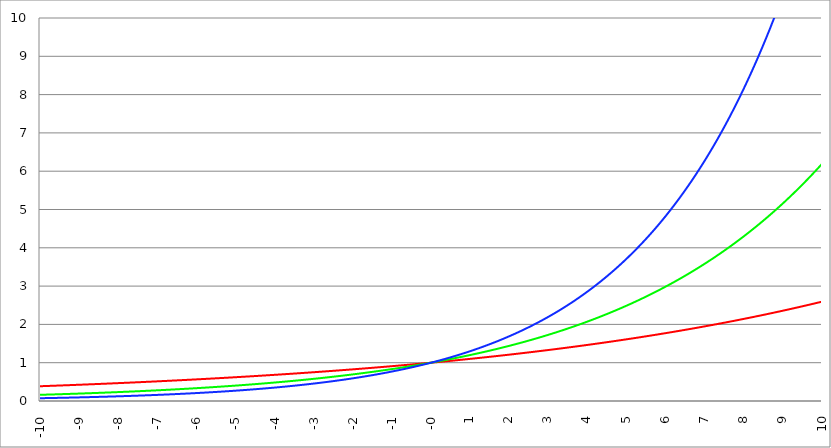
| Category | Series 1 | Series 0 | Series 2 |
|---|---|---|---|
| -10.0 | 0.386 | 0.162 | 0.073 |
| -9.99 | 0.386 | 0.162 | 0.073 |
| -9.98 | 0.386 | 0.162 | 0.073 |
| -9.97 | 0.387 | 0.162 | 0.073 |
| -9.96 | 0.387 | 0.163 | 0.073 |
| -9.95 | 0.387 | 0.163 | 0.073 |
| -9.940000000000001 | 0.388 | 0.163 | 0.074 |
| -9.930000000000001 | 0.388 | 0.164 | 0.074 |
| -9.920000000000002 | 0.388 | 0.164 | 0.074 |
| -9.91 | 0.389 | 0.164 | 0.074 |
| -9.900000000000002 | 0.389 | 0.164 | 0.074 |
| -9.890000000000002 | 0.39 | 0.165 | 0.075 |
| -9.880000000000003 | 0.39 | 0.165 | 0.075 |
| -9.870000000000003 | 0.39 | 0.165 | 0.075 |
| -9.860000000000001 | 0.391 | 0.166 | 0.075 |
| -9.850000000000003 | 0.391 | 0.166 | 0.075 |
| -9.840000000000003 | 0.391 | 0.166 | 0.076 |
| -9.830000000000004 | 0.392 | 0.167 | 0.076 |
| -9.820000000000004 | 0.392 | 0.167 | 0.076 |
| -9.810000000000004 | 0.393 | 0.167 | 0.076 |
| -9.800000000000004 | 0.393 | 0.168 | 0.076 |
| -9.790000000000004 | 0.393 | 0.168 | 0.077 |
| -9.780000000000005 | 0.394 | 0.168 | 0.077 |
| -9.770000000000005 | 0.394 | 0.168 | 0.077 |
| -9.760000000000005 | 0.394 | 0.169 | 0.077 |
| -9.750000000000005 | 0.395 | 0.169 | 0.077 |
| -9.740000000000006 | 0.395 | 0.169 | 0.078 |
| -9.730000000000006 | 0.396 | 0.17 | 0.078 |
| -9.720000000000006 | 0.396 | 0.17 | 0.078 |
| -9.710000000000006 | 0.396 | 0.17 | 0.078 |
| -9.700000000000006 | 0.397 | 0.171 | 0.078 |
| -9.690000000000007 | 0.397 | 0.171 | 0.079 |
| -9.680000000000007 | 0.397 | 0.171 | 0.079 |
| -9.670000000000007 | 0.398 | 0.172 | 0.079 |
| -9.660000000000007 | 0.398 | 0.172 | 0.079 |
| -9.650000000000007 | 0.399 | 0.172 | 0.08 |
| -9.640000000000008 | 0.399 | 0.172 | 0.08 |
| -9.630000000000008 | 0.399 | 0.173 | 0.08 |
| -9.620000000000008 | 0.4 | 0.173 | 0.08 |
| -9.610000000000008 | 0.4 | 0.173 | 0.08 |
| -9.600000000000009 | 0.401 | 0.174 | 0.081 |
| -9.590000000000009 | 0.401 | 0.174 | 0.081 |
| -9.580000000000007 | 0.401 | 0.174 | 0.081 |
| -9.57000000000001 | 0.402 | 0.175 | 0.081 |
| -9.56000000000001 | 0.402 | 0.175 | 0.081 |
| -9.55000000000001 | 0.402 | 0.175 | 0.082 |
| -9.54000000000001 | 0.403 | 0.176 | 0.082 |
| -9.53000000000001 | 0.403 | 0.176 | 0.082 |
| -9.52000000000001 | 0.404 | 0.176 | 0.082 |
| -9.51000000000001 | 0.404 | 0.177 | 0.082 |
| -9.50000000000001 | 0.404 | 0.177 | 0.083 |
| -9.49000000000001 | 0.405 | 0.177 | 0.083 |
| -9.48000000000001 | 0.405 | 0.178 | 0.083 |
| -9.47000000000001 | 0.406 | 0.178 | 0.083 |
| -9.46000000000001 | 0.406 | 0.178 | 0.084 |
| -9.45000000000001 | 0.406 | 0.179 | 0.084 |
| -9.44000000000001 | 0.407 | 0.179 | 0.084 |
| -9.430000000000012 | 0.407 | 0.179 | 0.084 |
| -9.420000000000012 | 0.407 | 0.18 | 0.084 |
| -9.410000000000013 | 0.408 | 0.18 | 0.085 |
| -9.400000000000013 | 0.408 | 0.18 | 0.085 |
| -9.390000000000011 | 0.409 | 0.181 | 0.085 |
| -9.380000000000013 | 0.409 | 0.181 | 0.085 |
| -9.370000000000013 | 0.409 | 0.181 | 0.086 |
| -9.360000000000014 | 0.41 | 0.181 | 0.086 |
| -9.350000000000014 | 0.41 | 0.182 | 0.086 |
| -9.340000000000014 | 0.411 | 0.182 | 0.086 |
| -9.330000000000014 | 0.411 | 0.182 | 0.086 |
| -9.320000000000014 | 0.411 | 0.183 | 0.087 |
| -9.310000000000015 | 0.412 | 0.183 | 0.087 |
| -9.300000000000013 | 0.412 | 0.183 | 0.087 |
| -9.290000000000015 | 0.413 | 0.184 | 0.087 |
| -9.280000000000015 | 0.413 | 0.184 | 0.088 |
| -9.270000000000016 | 0.413 | 0.184 | 0.088 |
| -9.260000000000016 | 0.414 | 0.185 | 0.088 |
| -9.250000000000014 | 0.414 | 0.185 | 0.088 |
| -9.240000000000016 | 0.415 | 0.186 | 0.089 |
| -9.230000000000016 | 0.415 | 0.186 | 0.089 |
| -9.220000000000017 | 0.415 | 0.186 | 0.089 |
| -9.210000000000017 | 0.416 | 0.187 | 0.089 |
| -9.200000000000017 | 0.416 | 0.187 | 0.089 |
| -9.190000000000017 | 0.416 | 0.187 | 0.09 |
| -9.180000000000017 | 0.417 | 0.188 | 0.09 |
| -9.170000000000018 | 0.417 | 0.188 | 0.09 |
| -9.160000000000016 | 0.418 | 0.188 | 0.09 |
| -9.150000000000018 | 0.418 | 0.189 | 0.091 |
| -9.140000000000018 | 0.418 | 0.189 | 0.091 |
| -9.130000000000019 | 0.419 | 0.189 | 0.091 |
| -9.120000000000019 | 0.419 | 0.19 | 0.091 |
| -9.110000000000017 | 0.42 | 0.19 | 0.092 |
| -9.10000000000002 | 0.42 | 0.19 | 0.092 |
| -9.09000000000002 | 0.42 | 0.191 | 0.092 |
| -9.08000000000002 | 0.421 | 0.191 | 0.092 |
| -9.07000000000002 | 0.421 | 0.191 | 0.093 |
| -9.06000000000002 | 0.422 | 0.192 | 0.093 |
| -9.05000000000002 | 0.422 | 0.192 | 0.093 |
| -9.04000000000002 | 0.422 | 0.192 | 0.093 |
| -9.03000000000002 | 0.423 | 0.193 | 0.094 |
| -9.020000000000021 | 0.423 | 0.193 | 0.094 |
| -9.010000000000021 | 0.424 | 0.193 | 0.094 |
| -9.000000000000021 | 0.424 | 0.194 | 0.094 |
| -8.990000000000022 | 0.425 | 0.194 | 0.095 |
| -8.980000000000022 | 0.425 | 0.195 | 0.095 |
| -8.97000000000002 | 0.425 | 0.195 | 0.095 |
| -8.960000000000022 | 0.426 | 0.195 | 0.095 |
| -8.950000000000022 | 0.426 | 0.196 | 0.096 |
| -8.940000000000023 | 0.427 | 0.196 | 0.096 |
| -8.930000000000023 | 0.427 | 0.196 | 0.096 |
| -8.920000000000023 | 0.427 | 0.197 | 0.096 |
| -8.910000000000023 | 0.428 | 0.197 | 0.097 |
| -8.900000000000023 | 0.428 | 0.197 | 0.097 |
| -8.890000000000024 | 0.429 | 0.198 | 0.097 |
| -8.880000000000024 | 0.429 | 0.198 | 0.097 |
| -8.870000000000024 | 0.429 | 0.198 | 0.098 |
| -8.860000000000024 | 0.43 | 0.199 | 0.098 |
| -8.850000000000025 | 0.43 | 0.199 | 0.098 |
| -8.840000000000025 | 0.431 | 0.2 | 0.098 |
| -8.830000000000025 | 0.431 | 0.2 | 0.099 |
| -8.820000000000025 | 0.431 | 0.2 | 0.099 |
| -8.810000000000025 | 0.432 | 0.201 | 0.099 |
| -8.800000000000026 | 0.432 | 0.201 | 0.099 |
| -8.790000000000026 | 0.433 | 0.201 | 0.1 |
| -8.780000000000026 | 0.433 | 0.202 | 0.1 |
| -8.770000000000026 | 0.433 | 0.202 | 0.1 |
| -8.760000000000026 | 0.434 | 0.202 | 0.1 |
| -8.750000000000027 | 0.434 | 0.203 | 0.101 |
| -8.740000000000027 | 0.435 | 0.203 | 0.101 |
| -8.730000000000027 | 0.435 | 0.204 | 0.101 |
| -8.720000000000027 | 0.436 | 0.204 | 0.101 |
| -8.710000000000027 | 0.436 | 0.204 | 0.102 |
| -8.700000000000028 | 0.436 | 0.205 | 0.102 |
| -8.690000000000028 | 0.437 | 0.205 | 0.102 |
| -8.680000000000028 | 0.437 | 0.205 | 0.103 |
| -8.670000000000028 | 0.438 | 0.206 | 0.103 |
| -8.660000000000029 | 0.438 | 0.206 | 0.103 |
| -8.650000000000029 | 0.438 | 0.207 | 0.103 |
| -8.640000000000029 | 0.439 | 0.207 | 0.104 |
| -8.63000000000003 | 0.439 | 0.207 | 0.104 |
| -8.62000000000003 | 0.44 | 0.208 | 0.104 |
| -8.61000000000003 | 0.44 | 0.208 | 0.104 |
| -8.60000000000003 | 0.441 | 0.208 | 0.105 |
| -8.59000000000003 | 0.441 | 0.209 | 0.105 |
| -8.58000000000003 | 0.441 | 0.209 | 0.105 |
| -8.57000000000003 | 0.442 | 0.21 | 0.106 |
| -8.56000000000003 | 0.442 | 0.21 | 0.106 |
| -8.55000000000003 | 0.443 | 0.21 | 0.106 |
| -8.540000000000031 | 0.443 | 0.211 | 0.106 |
| -8.530000000000031 | 0.444 | 0.211 | 0.107 |
| -8.520000000000032 | 0.444 | 0.212 | 0.107 |
| -8.510000000000032 | 0.444 | 0.212 | 0.107 |
| -8.50000000000003 | 0.445 | 0.212 | 0.108 |
| -8.490000000000032 | 0.445 | 0.213 | 0.108 |
| -8.480000000000032 | 0.446 | 0.213 | 0.108 |
| -8.470000000000033 | 0.446 | 0.213 | 0.108 |
| -8.460000000000033 | 0.446 | 0.214 | 0.109 |
| -8.450000000000033 | 0.447 | 0.214 | 0.109 |
| -8.440000000000033 | 0.447 | 0.215 | 0.109 |
| -8.430000000000033 | 0.448 | 0.215 | 0.11 |
| -8.420000000000034 | 0.448 | 0.215 | 0.11 |
| -8.410000000000032 | 0.449 | 0.216 | 0.11 |
| -8.400000000000034 | 0.449 | 0.216 | 0.11 |
| -8.390000000000034 | 0.449 | 0.217 | 0.111 |
| -8.380000000000035 | 0.45 | 0.217 | 0.111 |
| -8.370000000000035 | 0.45 | 0.217 | 0.111 |
| -8.360000000000033 | 0.451 | 0.218 | 0.112 |
| -8.350000000000035 | 0.451 | 0.218 | 0.112 |
| -8.340000000000035 | 0.452 | 0.219 | 0.112 |
| -8.330000000000036 | 0.452 | 0.219 | 0.112 |
| -8.320000000000036 | 0.452 | 0.219 | 0.113 |
| -8.310000000000034 | 0.453 | 0.22 | 0.113 |
| -8.300000000000036 | 0.453 | 0.22 | 0.113 |
| -8.290000000000036 | 0.454 | 0.221 | 0.114 |
| -8.280000000000037 | 0.454 | 0.221 | 0.114 |
| -8.270000000000037 | 0.455 | 0.221 | 0.114 |
| -8.260000000000037 | 0.455 | 0.222 | 0.115 |
| -8.250000000000037 | 0.456 | 0.222 | 0.115 |
| -8.240000000000038 | 0.456 | 0.223 | 0.115 |
| -8.230000000000038 | 0.456 | 0.223 | 0.115 |
| -8.220000000000038 | 0.457 | 0.223 | 0.116 |
| -8.210000000000038 | 0.457 | 0.224 | 0.116 |
| -8.200000000000038 | 0.458 | 0.224 | 0.116 |
| -8.190000000000039 | 0.458 | 0.225 | 0.117 |
| -8.180000000000039 | 0.459 | 0.225 | 0.117 |
| -8.170000000000037 | 0.459 | 0.225 | 0.117 |
| -8.16000000000004 | 0.459 | 0.226 | 0.118 |
| -8.15000000000004 | 0.46 | 0.226 | 0.118 |
| -8.14000000000004 | 0.46 | 0.227 | 0.118 |
| -8.13000000000004 | 0.461 | 0.227 | 0.118 |
| -8.12000000000004 | 0.461 | 0.228 | 0.119 |
| -8.11000000000004 | 0.462 | 0.228 | 0.119 |
| -8.10000000000004 | 0.462 | 0.228 | 0.119 |
| -8.09000000000004 | 0.463 | 0.229 | 0.12 |
| -8.08000000000004 | 0.463 | 0.229 | 0.12 |
| -8.07000000000004 | 0.463 | 0.23 | 0.12 |
| -8.06000000000004 | 0.464 | 0.23 | 0.121 |
| -8.05000000000004 | 0.464 | 0.23 | 0.121 |
| -8.040000000000042 | 0.465 | 0.231 | 0.121 |
| -8.03000000000004 | 0.465 | 0.231 | 0.122 |
| -8.020000000000042 | 0.466 | 0.232 | 0.122 |
| -8.010000000000042 | 0.466 | 0.232 | 0.122 |
| -8.000000000000043 | 0.467 | 0.233 | 0.123 |
| -7.990000000000043 | 0.467 | 0.233 | 0.123 |
| -7.980000000000043 | 0.467 | 0.233 | 0.123 |
| -7.970000000000043 | 0.468 | 0.234 | 0.124 |
| -7.960000000000043 | 0.468 | 0.234 | 0.124 |
| -7.950000000000044 | 0.469 | 0.235 | 0.124 |
| -7.940000000000044 | 0.469 | 0.235 | 0.125 |
| -7.930000000000044 | 0.47 | 0.236 | 0.125 |
| -7.920000000000044 | 0.47 | 0.236 | 0.125 |
| -7.910000000000044 | 0.471 | 0.236 | 0.126 |
| -7.900000000000044 | 0.471 | 0.237 | 0.126 |
| -7.890000000000045 | 0.471 | 0.237 | 0.126 |
| -7.880000000000045 | 0.472 | 0.238 | 0.127 |
| -7.870000000000045 | 0.472 | 0.238 | 0.127 |
| -7.860000000000046 | 0.473 | 0.239 | 0.127 |
| -7.850000000000046 | 0.473 | 0.239 | 0.128 |
| -7.840000000000046 | 0.474 | 0.239 | 0.128 |
| -7.830000000000046 | 0.474 | 0.24 | 0.128 |
| -7.820000000000046 | 0.475 | 0.24 | 0.129 |
| -7.810000000000047 | 0.475 | 0.241 | 0.129 |
| -7.800000000000047 | 0.475 | 0.241 | 0.129 |
| -7.790000000000047 | 0.476 | 0.242 | 0.13 |
| -7.780000000000047 | 0.476 | 0.242 | 0.13 |
| -7.770000000000047 | 0.477 | 0.243 | 0.13 |
| -7.760000000000048 | 0.477 | 0.243 | 0.131 |
| -7.750000000000048 | 0.478 | 0.243 | 0.131 |
| -7.740000000000048 | 0.478 | 0.244 | 0.131 |
| -7.730000000000048 | 0.479 | 0.244 | 0.132 |
| -7.720000000000049 | 0.479 | 0.245 | 0.132 |
| -7.710000000000049 | 0.48 | 0.245 | 0.132 |
| -7.700000000000049 | 0.48 | 0.246 | 0.133 |
| -7.690000000000049 | 0.48 | 0.246 | 0.133 |
| -7.680000000000049 | 0.481 | 0.247 | 0.133 |
| -7.67000000000005 | 0.481 | 0.247 | 0.134 |
| -7.66000000000005 | 0.482 | 0.247 | 0.134 |
| -7.65000000000005 | 0.482 | 0.248 | 0.134 |
| -7.64000000000005 | 0.483 | 0.248 | 0.135 |
| -7.63000000000005 | 0.483 | 0.249 | 0.135 |
| -7.620000000000051 | 0.484 | 0.249 | 0.135 |
| -7.610000000000051 | 0.484 | 0.25 | 0.136 |
| -7.600000000000051 | 0.485 | 0.25 | 0.136 |
| -7.590000000000051 | 0.485 | 0.251 | 0.137 |
| -7.580000000000052 | 0.486 | 0.251 | 0.137 |
| -7.570000000000052 | 0.486 | 0.252 | 0.137 |
| -7.560000000000052 | 0.486 | 0.252 | 0.138 |
| -7.550000000000052 | 0.487 | 0.252 | 0.138 |
| -7.540000000000052 | 0.487 | 0.253 | 0.138 |
| -7.530000000000053 | 0.488 | 0.253 | 0.139 |
| -7.520000000000053 | 0.488 | 0.254 | 0.139 |
| -7.510000000000053 | 0.489 | 0.254 | 0.139 |
| -7.500000000000053 | 0.489 | 0.255 | 0.14 |
| -7.490000000000053 | 0.49 | 0.255 | 0.14 |
| -7.480000000000054 | 0.49 | 0.256 | 0.141 |
| -7.470000000000054 | 0.491 | 0.256 | 0.141 |
| -7.460000000000054 | 0.491 | 0.257 | 0.141 |
| -7.450000000000054 | 0.492 | 0.257 | 0.142 |
| -7.440000000000054 | 0.492 | 0.258 | 0.142 |
| -7.430000000000054 | 0.493 | 0.258 | 0.142 |
| -7.420000000000055 | 0.493 | 0.259 | 0.143 |
| -7.410000000000055 | 0.493 | 0.259 | 0.143 |
| -7.400000000000055 | 0.494 | 0.259 | 0.143 |
| -7.390000000000056 | 0.494 | 0.26 | 0.144 |
| -7.380000000000056 | 0.495 | 0.26 | 0.144 |
| -7.370000000000056 | 0.495 | 0.261 | 0.145 |
| -7.360000000000056 | 0.496 | 0.261 | 0.145 |
| -7.350000000000056 | 0.496 | 0.262 | 0.145 |
| -7.340000000000057 | 0.497 | 0.262 | 0.146 |
| -7.330000000000057 | 0.497 | 0.263 | 0.146 |
| -7.320000000000057 | 0.498 | 0.263 | 0.147 |
| -7.310000000000057 | 0.498 | 0.264 | 0.147 |
| -7.300000000000058 | 0.499 | 0.264 | 0.147 |
| -7.290000000000058 | 0.499 | 0.265 | 0.148 |
| -7.280000000000058 | 0.5 | 0.265 | 0.148 |
| -7.270000000000058 | 0.5 | 0.266 | 0.148 |
| -7.260000000000058 | 0.501 | 0.266 | 0.149 |
| -7.250000000000059 | 0.501 | 0.267 | 0.149 |
| -7.240000000000059 | 0.502 | 0.267 | 0.15 |
| -7.23000000000006 | 0.502 | 0.268 | 0.15 |
| -7.220000000000059 | 0.503 | 0.268 | 0.15 |
| -7.210000000000059 | 0.503 | 0.269 | 0.151 |
| -7.20000000000006 | 0.503 | 0.269 | 0.151 |
| -7.19000000000006 | 0.504 | 0.27 | 0.152 |
| -7.18000000000006 | 0.504 | 0.27 | 0.152 |
| -7.17000000000006 | 0.505 | 0.271 | 0.152 |
| -7.160000000000061 | 0.505 | 0.271 | 0.153 |
| -7.150000000000061 | 0.506 | 0.272 | 0.153 |
| -7.140000000000061 | 0.506 | 0.272 | 0.154 |
| -7.130000000000061 | 0.507 | 0.273 | 0.154 |
| -7.120000000000061 | 0.507 | 0.273 | 0.154 |
| -7.110000000000062 | 0.508 | 0.274 | 0.155 |
| -7.100000000000062 | 0.508 | 0.274 | 0.155 |
| -7.090000000000062 | 0.509 | 0.275 | 0.156 |
| -7.080000000000062 | 0.509 | 0.275 | 0.156 |
| -7.070000000000062 | 0.51 | 0.276 | 0.156 |
| -7.060000000000063 | 0.51 | 0.276 | 0.157 |
| -7.050000000000063 | 0.511 | 0.277 | 0.157 |
| -7.040000000000063 | 0.511 | 0.277 | 0.158 |
| -7.030000000000063 | 0.512 | 0.278 | 0.158 |
| -7.020000000000064 | 0.512 | 0.278 | 0.159 |
| -7.010000000000064 | 0.513 | 0.279 | 0.159 |
| -7.000000000000064 | 0.513 | 0.279 | 0.159 |
| -6.990000000000064 | 0.514 | 0.28 | 0.16 |
| -6.980000000000064 | 0.514 | 0.28 | 0.16 |
| -6.970000000000064 | 0.515 | 0.281 | 0.161 |
| -6.960000000000064 | 0.515 | 0.281 | 0.161 |
| -6.950000000000064 | 0.516 | 0.282 | 0.161 |
| -6.940000000000065 | 0.516 | 0.282 | 0.162 |
| -6.930000000000065 | 0.517 | 0.283 | 0.162 |
| -6.920000000000065 | 0.517 | 0.283 | 0.163 |
| -6.910000000000065 | 0.518 | 0.284 | 0.163 |
| -6.900000000000066 | 0.518 | 0.284 | 0.164 |
| -6.890000000000066 | 0.519 | 0.285 | 0.164 |
| -6.880000000000066 | 0.519 | 0.285 | 0.164 |
| -6.870000000000066 | 0.52 | 0.286 | 0.165 |
| -6.860000000000067 | 0.52 | 0.286 | 0.165 |
| -6.850000000000067 | 0.521 | 0.287 | 0.166 |
| -6.840000000000067 | 0.521 | 0.287 | 0.166 |
| -6.830000000000067 | 0.522 | 0.288 | 0.167 |
| -6.820000000000068 | 0.522 | 0.288 | 0.167 |
| -6.810000000000068 | 0.523 | 0.289 | 0.168 |
| -6.800000000000068 | 0.523 | 0.289 | 0.168 |
| -6.790000000000068 | 0.524 | 0.29 | 0.168 |
| -6.780000000000068 | 0.524 | 0.291 | 0.169 |
| -6.770000000000068 | 0.525 | 0.291 | 0.169 |
| -6.760000000000069 | 0.525 | 0.292 | 0.17 |
| -6.75000000000007 | 0.526 | 0.292 | 0.17 |
| -6.74000000000007 | 0.526 | 0.293 | 0.171 |
| -6.73000000000007 | 0.527 | 0.293 | 0.171 |
| -6.72000000000007 | 0.527 | 0.294 | 0.172 |
| -6.71000000000007 | 0.528 | 0.294 | 0.172 |
| -6.70000000000007 | 0.528 | 0.295 | 0.172 |
| -6.69000000000007 | 0.529 | 0.295 | 0.173 |
| -6.680000000000071 | 0.529 | 0.296 | 0.173 |
| -6.670000000000071 | 0.53 | 0.296 | 0.174 |
| -6.660000000000071 | 0.53 | 0.297 | 0.174 |
| -6.650000000000071 | 0.531 | 0.297 | 0.175 |
| -6.640000000000072 | 0.531 | 0.298 | 0.175 |
| -6.630000000000072 | 0.532 | 0.299 | 0.176 |
| -6.620000000000072 | 0.532 | 0.299 | 0.176 |
| -6.610000000000072 | 0.533 | 0.3 | 0.177 |
| -6.600000000000072 | 0.533 | 0.3 | 0.177 |
| -6.590000000000073 | 0.534 | 0.301 | 0.177 |
| -6.580000000000073 | 0.534 | 0.301 | 0.178 |
| -6.570000000000073 | 0.535 | 0.302 | 0.178 |
| -6.560000000000073 | 0.535 | 0.302 | 0.179 |
| -6.550000000000074 | 0.536 | 0.303 | 0.179 |
| -6.540000000000074 | 0.536 | 0.303 | 0.18 |
| -6.530000000000074 | 0.537 | 0.304 | 0.18 |
| -6.520000000000074 | 0.537 | 0.305 | 0.181 |
| -6.510000000000074 | 0.538 | 0.305 | 0.181 |
| -6.500000000000074 | 0.538 | 0.306 | 0.182 |
| -6.490000000000074 | 0.539 | 0.306 | 0.182 |
| -6.480000000000074 | 0.539 | 0.307 | 0.183 |
| -6.470000000000075 | 0.54 | 0.307 | 0.183 |
| -6.460000000000075 | 0.54 | 0.308 | 0.184 |
| -6.450000000000075 | 0.541 | 0.309 | 0.184 |
| -6.440000000000075 | 0.541 | 0.309 | 0.185 |
| -6.430000000000076 | 0.542 | 0.31 | 0.185 |
| -6.420000000000076 | 0.542 | 0.31 | 0.186 |
| -6.410000000000076 | 0.543 | 0.311 | 0.186 |
| -6.400000000000076 | 0.543 | 0.311 | 0.187 |
| -6.390000000000077 | 0.544 | 0.312 | 0.187 |
| -6.380000000000077 | 0.544 | 0.312 | 0.188 |
| -6.370000000000077 | 0.545 | 0.313 | 0.188 |
| -6.360000000000078 | 0.545 | 0.314 | 0.189 |
| -6.350000000000078 | 0.546 | 0.314 | 0.189 |
| -6.340000000000078 | 0.546 | 0.315 | 0.189 |
| -6.330000000000078 | 0.547 | 0.315 | 0.19 |
| -6.320000000000078 | 0.548 | 0.316 | 0.19 |
| -6.310000000000079 | 0.548 | 0.316 | 0.191 |
| -6.300000000000079 | 0.549 | 0.317 | 0.191 |
| -6.29000000000008 | 0.549 | 0.318 | 0.192 |
| -6.28000000000008 | 0.55 | 0.318 | 0.193 |
| -6.27000000000008 | 0.55 | 0.319 | 0.193 |
| -6.26000000000008 | 0.551 | 0.319 | 0.194 |
| -6.25000000000008 | 0.551 | 0.32 | 0.194 |
| -6.24000000000008 | 0.552 | 0.321 | 0.195 |
| -6.23000000000008 | 0.552 | 0.321 | 0.195 |
| -6.220000000000081 | 0.553 | 0.322 | 0.196 |
| -6.210000000000081 | 0.553 | 0.322 | 0.196 |
| -6.200000000000081 | 0.554 | 0.323 | 0.197 |
| -6.190000000000081 | 0.554 | 0.323 | 0.197 |
| -6.180000000000081 | 0.555 | 0.324 | 0.198 |
| -6.170000000000082 | 0.555 | 0.325 | 0.198 |
| -6.160000000000082 | 0.556 | 0.325 | 0.199 |
| -6.150000000000082 | 0.556 | 0.326 | 0.199 |
| -6.140000000000082 | 0.557 | 0.326 | 0.2 |
| -6.130000000000082 | 0.558 | 0.327 | 0.2 |
| -6.120000000000083 | 0.558 | 0.328 | 0.201 |
| -6.110000000000083 | 0.559 | 0.328 | 0.201 |
| -6.100000000000083 | 0.559 | 0.329 | 0.202 |
| -6.090000000000083 | 0.56 | 0.329 | 0.202 |
| -6.080000000000084 | 0.56 | 0.33 | 0.203 |
| -6.070000000000084 | 0.561 | 0.331 | 0.203 |
| -6.060000000000084 | 0.561 | 0.331 | 0.204 |
| -6.050000000000084 | 0.562 | 0.332 | 0.204 |
| -6.040000000000084 | 0.562 | 0.332 | 0.205 |
| -6.030000000000084 | 0.563 | 0.333 | 0.206 |
| -6.020000000000085 | 0.563 | 0.334 | 0.206 |
| -6.010000000000085 | 0.564 | 0.334 | 0.207 |
| -6.000000000000085 | 0.564 | 0.335 | 0.207 |
| -5.990000000000085 | 0.565 | 0.336 | 0.208 |
| -5.980000000000085 | 0.566 | 0.336 | 0.208 |
| -5.970000000000085 | 0.566 | 0.337 | 0.209 |
| -5.960000000000086 | 0.567 | 0.337 | 0.209 |
| -5.950000000000086 | 0.567 | 0.338 | 0.21 |
| -5.940000000000086 | 0.568 | 0.339 | 0.21 |
| -5.930000000000086 | 0.568 | 0.339 | 0.211 |
| -5.920000000000087 | 0.569 | 0.34 | 0.212 |
| -5.910000000000087 | 0.569 | 0.34 | 0.212 |
| -5.900000000000087 | 0.57 | 0.341 | 0.213 |
| -5.890000000000088 | 0.57 | 0.342 | 0.213 |
| -5.880000000000088 | 0.571 | 0.342 | 0.214 |
| -5.870000000000088 | 0.572 | 0.343 | 0.214 |
| -5.860000000000088 | 0.572 | 0.344 | 0.215 |
| -5.850000000000088 | 0.573 | 0.344 | 0.215 |
| -5.840000000000089 | 0.573 | 0.345 | 0.216 |
| -5.830000000000089 | 0.574 | 0.345 | 0.217 |
| -5.820000000000089 | 0.574 | 0.346 | 0.217 |
| -5.810000000000089 | 0.575 | 0.347 | 0.218 |
| -5.800000000000089 | 0.575 | 0.347 | 0.218 |
| -5.79000000000009 | 0.576 | 0.348 | 0.219 |
| -5.78000000000009 | 0.576 | 0.349 | 0.219 |
| -5.77000000000009 | 0.577 | 0.349 | 0.22 |
| -5.76000000000009 | 0.578 | 0.35 | 0.221 |
| -5.750000000000091 | 0.578 | 0.351 | 0.221 |
| -5.740000000000091 | 0.579 | 0.351 | 0.222 |
| -5.730000000000091 | 0.579 | 0.352 | 0.222 |
| -5.720000000000091 | 0.58 | 0.352 | 0.223 |
| -5.710000000000091 | 0.58 | 0.353 | 0.224 |
| -5.700000000000092 | 0.581 | 0.354 | 0.224 |
| -5.690000000000092 | 0.581 | 0.354 | 0.225 |
| -5.680000000000092 | 0.582 | 0.355 | 0.225 |
| -5.670000000000092 | 0.583 | 0.356 | 0.226 |
| -5.660000000000092 | 0.583 | 0.356 | 0.227 |
| -5.650000000000093 | 0.584 | 0.357 | 0.227 |
| -5.640000000000093 | 0.584 | 0.358 | 0.228 |
| -5.630000000000093 | 0.585 | 0.358 | 0.228 |
| -5.620000000000093 | 0.585 | 0.359 | 0.229 |
| -5.610000000000093 | 0.586 | 0.36 | 0.229 |
| -5.600000000000094 | 0.586 | 0.36 | 0.23 |
| -5.590000000000094 | 0.587 | 0.361 | 0.231 |
| -5.580000000000094 | 0.588 | 0.362 | 0.231 |
| -5.570000000000094 | 0.588 | 0.362 | 0.232 |
| -5.560000000000095 | 0.589 | 0.363 | 0.233 |
| -5.550000000000095 | 0.589 | 0.364 | 0.233 |
| -5.540000000000095 | 0.59 | 0.364 | 0.234 |
| -5.530000000000095 | 0.59 | 0.365 | 0.234 |
| -5.520000000000095 | 0.591 | 0.366 | 0.235 |
| -5.510000000000096 | 0.591 | 0.366 | 0.236 |
| -5.500000000000096 | 0.592 | 0.367 | 0.236 |
| -5.490000000000096 | 0.593 | 0.368 | 0.237 |
| -5.480000000000096 | 0.593 | 0.368 | 0.237 |
| -5.470000000000096 | 0.594 | 0.369 | 0.238 |
| -5.460000000000097 | 0.594 | 0.37 | 0.239 |
| -5.450000000000097 | 0.595 | 0.37 | 0.239 |
| -5.440000000000097 | 0.595 | 0.371 | 0.24 |
| -5.430000000000097 | 0.596 | 0.372 | 0.241 |
| -5.420000000000098 | 0.597 | 0.372 | 0.241 |
| -5.410000000000098 | 0.597 | 0.373 | 0.242 |
| -5.400000000000098 | 0.598 | 0.374 | 0.242 |
| -5.390000000000098 | 0.598 | 0.374 | 0.243 |
| -5.380000000000098 | 0.599 | 0.375 | 0.244 |
| -5.370000000000099 | 0.599 | 0.376 | 0.244 |
| -5.360000000000099 | 0.6 | 0.376 | 0.245 |
| -5.350000000000099 | 0.601 | 0.377 | 0.246 |
| -5.340000000000099 | 0.601 | 0.378 | 0.246 |
| -5.330000000000099 | 0.602 | 0.378 | 0.247 |
| -5.3200000000001 | 0.602 | 0.379 | 0.248 |
| -5.3100000000001 | 0.603 | 0.38 | 0.248 |
| -5.3000000000001 | 0.603 | 0.38 | 0.249 |
| -5.2900000000001 | 0.604 | 0.381 | 0.25 |
| -5.2800000000001 | 0.605 | 0.382 | 0.25 |
| -5.2700000000001 | 0.605 | 0.383 | 0.251 |
| -5.260000000000101 | 0.606 | 0.383 | 0.252 |
| -5.250000000000101 | 0.606 | 0.384 | 0.252 |
| -5.240000000000101 | 0.607 | 0.385 | 0.253 |
| -5.230000000000101 | 0.607 | 0.385 | 0.254 |
| -5.220000000000102 | 0.608 | 0.386 | 0.254 |
| -5.210000000000102 | 0.609 | 0.387 | 0.255 |
| -5.200000000000102 | 0.609 | 0.387 | 0.256 |
| -5.190000000000103 | 0.61 | 0.388 | 0.256 |
| -5.180000000000103 | 0.61 | 0.389 | 0.257 |
| -5.170000000000103 | 0.611 | 0.39 | 0.258 |
| -5.160000000000103 | 0.612 | 0.39 | 0.258 |
| -5.150000000000103 | 0.612 | 0.391 | 0.259 |
| -5.140000000000104 | 0.613 | 0.392 | 0.26 |
| -5.130000000000104 | 0.613 | 0.392 | 0.26 |
| -5.120000000000104 | 0.614 | 0.393 | 0.261 |
| -5.110000000000104 | 0.614 | 0.394 | 0.262 |
| -5.100000000000104 | 0.615 | 0.395 | 0.262 |
| -5.090000000000104 | 0.616 | 0.395 | 0.263 |
| -5.080000000000104 | 0.616 | 0.396 | 0.264 |
| -5.070000000000105 | 0.617 | 0.397 | 0.264 |
| -5.060000000000105 | 0.617 | 0.398 | 0.265 |
| -5.050000000000105 | 0.618 | 0.398 | 0.266 |
| -5.040000000000105 | 0.619 | 0.399 | 0.267 |
| -5.030000000000105 | 0.619 | 0.4 | 0.267 |
| -5.020000000000106 | 0.62 | 0.4 | 0.268 |
| -5.010000000000106 | 0.62 | 0.401 | 0.269 |
| -5.000000000000106 | 0.621 | 0.402 | 0.269 |
| -4.990000000000106 | 0.622 | 0.403 | 0.27 |
| -4.980000000000106 | 0.622 | 0.403 | 0.271 |
| -4.970000000000107 | 0.623 | 0.404 | 0.271 |
| -4.960000000000107 | 0.623 | 0.405 | 0.272 |
| -4.950000000000107 | 0.624 | 0.406 | 0.273 |
| -4.940000000000107 | 0.624 | 0.406 | 0.274 |
| -4.930000000000108 | 0.625 | 0.407 | 0.274 |
| -4.920000000000108 | 0.626 | 0.408 | 0.275 |
| -4.910000000000108 | 0.626 | 0.409 | 0.276 |
| -4.900000000000108 | 0.627 | 0.409 | 0.276 |
| -4.890000000000109 | 0.627 | 0.41 | 0.277 |
| -4.88000000000011 | 0.628 | 0.411 | 0.278 |
| -4.87000000000011 | 0.629 | 0.412 | 0.279 |
| -4.86000000000011 | 0.629 | 0.412 | 0.279 |
| -4.85000000000011 | 0.63 | 0.413 | 0.28 |
| -4.84000000000011 | 0.63 | 0.414 | 0.281 |
| -4.83000000000011 | 0.631 | 0.415 | 0.282 |
| -4.82000000000011 | 0.632 | 0.415 | 0.282 |
| -4.810000000000111 | 0.632 | 0.416 | 0.283 |
| -4.800000000000111 | 0.633 | 0.417 | 0.284 |
| -4.790000000000111 | 0.633 | 0.418 | 0.285 |
| -4.780000000000111 | 0.634 | 0.418 | 0.285 |
| -4.770000000000111 | 0.635 | 0.419 | 0.286 |
| -4.760000000000112 | 0.635 | 0.42 | 0.287 |
| -4.750000000000112 | 0.636 | 0.421 | 0.288 |
| -4.740000000000112 | 0.637 | 0.421 | 0.288 |
| -4.730000000000112 | 0.637 | 0.422 | 0.289 |
| -4.720000000000112 | 0.638 | 0.423 | 0.29 |
| -4.710000000000113 | 0.638 | 0.424 | 0.291 |
| -4.700000000000113 | 0.639 | 0.424 | 0.291 |
| -4.690000000000113 | 0.64 | 0.425 | 0.292 |
| -4.680000000000113 | 0.64 | 0.426 | 0.293 |
| -4.670000000000114 | 0.641 | 0.427 | 0.294 |
| -4.660000000000114 | 0.641 | 0.428 | 0.294 |
| -4.650000000000114 | 0.642 | 0.428 | 0.295 |
| -4.640000000000114 | 0.643 | 0.429 | 0.296 |
| -4.630000000000114 | 0.643 | 0.43 | 0.297 |
| -4.620000000000115 | 0.644 | 0.431 | 0.298 |
| -4.610000000000115 | 0.644 | 0.431 | 0.298 |
| -4.600000000000115 | 0.645 | 0.432 | 0.299 |
| -4.590000000000115 | 0.646 | 0.433 | 0.3 |
| -4.580000000000115 | 0.646 | 0.434 | 0.301 |
| -4.570000000000115 | 0.647 | 0.435 | 0.301 |
| -4.560000000000116 | 0.648 | 0.435 | 0.302 |
| -4.550000000000116 | 0.648 | 0.436 | 0.303 |
| -4.540000000000116 | 0.649 | 0.437 | 0.304 |
| -4.530000000000116 | 0.649 | 0.438 | 0.305 |
| -4.520000000000117 | 0.65 | 0.439 | 0.305 |
| -4.510000000000117 | 0.651 | 0.439 | 0.306 |
| -4.500000000000117 | 0.651 | 0.44 | 0.307 |
| -4.490000000000117 | 0.652 | 0.441 | 0.308 |
| -4.480000000000117 | 0.652 | 0.442 | 0.309 |
| -4.470000000000117 | 0.653 | 0.443 | 0.31 |
| -4.460000000000118 | 0.654 | 0.443 | 0.31 |
| -4.450000000000118 | 0.654 | 0.444 | 0.311 |
| -4.440000000000118 | 0.655 | 0.445 | 0.312 |
| -4.430000000000118 | 0.656 | 0.446 | 0.313 |
| -4.420000000000119 | 0.656 | 0.447 | 0.314 |
| -4.41000000000012 | 0.657 | 0.448 | 0.314 |
| -4.40000000000012 | 0.657 | 0.448 | 0.315 |
| -4.39000000000012 | 0.658 | 0.449 | 0.316 |
| -4.38000000000012 | 0.659 | 0.45 | 0.317 |
| -4.37000000000012 | 0.659 | 0.451 | 0.318 |
| -4.36000000000012 | 0.66 | 0.452 | 0.319 |
| -4.35000000000012 | 0.661 | 0.452 | 0.319 |
| -4.34000000000012 | 0.661 | 0.453 | 0.32 |
| -4.33000000000012 | 0.662 | 0.454 | 0.321 |
| -4.320000000000121 | 0.662 | 0.455 | 0.322 |
| -4.310000000000121 | 0.663 | 0.456 | 0.323 |
| -4.300000000000121 | 0.664 | 0.457 | 0.324 |
| -4.290000000000121 | 0.664 | 0.457 | 0.324 |
| -4.280000000000121 | 0.665 | 0.458 | 0.325 |
| -4.270000000000122 | 0.666 | 0.459 | 0.326 |
| -4.260000000000122 | 0.666 | 0.46 | 0.327 |
| -4.250000000000122 | 0.667 | 0.461 | 0.328 |
| -4.240000000000122 | 0.668 | 0.462 | 0.329 |
| -4.230000000000122 | 0.668 | 0.462 | 0.33 |
| -4.220000000000123 | 0.669 | 0.463 | 0.33 |
| -4.210000000000123 | 0.669 | 0.464 | 0.331 |
| -4.200000000000123 | 0.67 | 0.465 | 0.332 |
| -4.190000000000124 | 0.671 | 0.466 | 0.333 |
| -4.180000000000124 | 0.671 | 0.467 | 0.334 |
| -4.170000000000124 | 0.672 | 0.468 | 0.335 |
| -4.160000000000124 | 0.673 | 0.468 | 0.336 |
| -4.150000000000124 | 0.673 | 0.469 | 0.337 |
| -4.140000000000124 | 0.674 | 0.47 | 0.338 |
| -4.130000000000125 | 0.675 | 0.471 | 0.338 |
| -4.120000000000125 | 0.675 | 0.472 | 0.339 |
| -4.110000000000125 | 0.676 | 0.473 | 0.34 |
| -4.100000000000125 | 0.677 | 0.474 | 0.341 |
| -4.090000000000125 | 0.677 | 0.474 | 0.342 |
| -4.080000000000126 | 0.678 | 0.475 | 0.343 |
| -4.070000000000126 | 0.678 | 0.476 | 0.344 |
| -4.060000000000126 | 0.679 | 0.477 | 0.345 |
| -4.050000000000126 | 0.68 | 0.478 | 0.346 |
| -4.040000000000127 | 0.68 | 0.479 | 0.346 |
| -4.030000000000127 | 0.681 | 0.48 | 0.347 |
| -4.020000000000127 | 0.682 | 0.48 | 0.348 |
| -4.010000000000127 | 0.682 | 0.481 | 0.349 |
| -4.000000000000127 | 0.683 | 0.482 | 0.35 |
| -3.990000000000128 | 0.684 | 0.483 | 0.351 |
| -3.980000000000128 | 0.684 | 0.484 | 0.352 |
| -3.970000000000129 | 0.685 | 0.485 | 0.353 |
| -3.960000000000129 | 0.686 | 0.486 | 0.354 |
| -3.950000000000129 | 0.686 | 0.487 | 0.355 |
| -3.940000000000129 | 0.687 | 0.488 | 0.356 |
| -3.930000000000129 | 0.688 | 0.488 | 0.357 |
| -3.92000000000013 | 0.688 | 0.489 | 0.358 |
| -3.91000000000013 | 0.689 | 0.49 | 0.358 |
| -3.90000000000013 | 0.69 | 0.491 | 0.359 |
| -3.89000000000013 | 0.69 | 0.492 | 0.36 |
| -3.88000000000013 | 0.691 | 0.493 | 0.361 |
| -3.870000000000131 | 0.692 | 0.494 | 0.362 |
| -3.860000000000131 | 0.692 | 0.495 | 0.363 |
| -3.850000000000131 | 0.693 | 0.496 | 0.364 |
| -3.840000000000131 | 0.694 | 0.497 | 0.365 |
| -3.830000000000131 | 0.694 | 0.497 | 0.366 |
| -3.820000000000132 | 0.695 | 0.498 | 0.367 |
| -3.810000000000132 | 0.695 | 0.499 | 0.368 |
| -3.800000000000132 | 0.696 | 0.5 | 0.369 |
| -3.790000000000132 | 0.697 | 0.501 | 0.37 |
| -3.780000000000132 | 0.697 | 0.502 | 0.371 |
| -3.770000000000133 | 0.698 | 0.503 | 0.372 |
| -3.760000000000133 | 0.699 | 0.504 | 0.373 |
| -3.750000000000133 | 0.699 | 0.505 | 0.374 |
| -3.740000000000133 | 0.7 | 0.506 | 0.375 |
| -3.730000000000134 | 0.701 | 0.507 | 0.376 |
| -3.720000000000134 | 0.701 | 0.508 | 0.377 |
| -3.710000000000134 | 0.702 | 0.508 | 0.378 |
| -3.700000000000134 | 0.703 | 0.509 | 0.379 |
| -3.690000000000134 | 0.703 | 0.51 | 0.38 |
| -3.680000000000135 | 0.704 | 0.511 | 0.381 |
| -3.670000000000135 | 0.705 | 0.512 | 0.382 |
| -3.660000000000135 | 0.706 | 0.513 | 0.383 |
| -3.650000000000135 | 0.706 | 0.514 | 0.384 |
| -3.640000000000135 | 0.707 | 0.515 | 0.385 |
| -3.630000000000136 | 0.708 | 0.516 | 0.386 |
| -3.620000000000136 | 0.708 | 0.517 | 0.387 |
| -3.610000000000136 | 0.709 | 0.518 | 0.388 |
| -3.600000000000136 | 0.71 | 0.519 | 0.389 |
| -3.590000000000137 | 0.71 | 0.52 | 0.39 |
| -3.580000000000137 | 0.711 | 0.521 | 0.391 |
| -3.570000000000137 | 0.712 | 0.522 | 0.392 |
| -3.560000000000137 | 0.712 | 0.523 | 0.393 |
| -3.550000000000137 | 0.713 | 0.523 | 0.394 |
| -3.540000000000138 | 0.714 | 0.524 | 0.395 |
| -3.530000000000138 | 0.714 | 0.525 | 0.396 |
| -3.520000000000138 | 0.715 | 0.526 | 0.397 |
| -3.510000000000138 | 0.716 | 0.527 | 0.398 |
| -3.500000000000139 | 0.716 | 0.528 | 0.399 |
| -3.490000000000139 | 0.717 | 0.529 | 0.4 |
| -3.480000000000139 | 0.718 | 0.53 | 0.401 |
| -3.470000000000139 | 0.718 | 0.531 | 0.402 |
| -3.460000000000139 | 0.719 | 0.532 | 0.403 |
| -3.45000000000014 | 0.72 | 0.533 | 0.404 |
| -3.44000000000014 | 0.72 | 0.534 | 0.406 |
| -3.43000000000014 | 0.721 | 0.535 | 0.407 |
| -3.42000000000014 | 0.722 | 0.536 | 0.408 |
| -3.41000000000014 | 0.723 | 0.537 | 0.409 |
| -3.400000000000141 | 0.723 | 0.538 | 0.41 |
| -3.390000000000141 | 0.724 | 0.539 | 0.411 |
| -3.380000000000141 | 0.725 | 0.54 | 0.412 |
| -3.370000000000141 | 0.725 | 0.541 | 0.413 |
| -3.360000000000141 | 0.726 | 0.542 | 0.414 |
| -3.350000000000142 | 0.727 | 0.543 | 0.415 |
| -3.340000000000142 | 0.727 | 0.544 | 0.416 |
| -3.330000000000142 | 0.728 | 0.545 | 0.417 |
| -3.320000000000142 | 0.729 | 0.546 | 0.419 |
| -3.310000000000143 | 0.729 | 0.547 | 0.42 |
| -3.300000000000143 | 0.73 | 0.548 | 0.421 |
| -3.290000000000143 | 0.731 | 0.549 | 0.422 |
| -3.280000000000143 | 0.732 | 0.55 | 0.423 |
| -3.270000000000143 | 0.732 | 0.551 | 0.424 |
| -3.260000000000144 | 0.733 | 0.552 | 0.425 |
| -3.250000000000144 | 0.734 | 0.553 | 0.426 |
| -3.240000000000144 | 0.734 | 0.554 | 0.427 |
| -3.230000000000144 | 0.735 | 0.555 | 0.429 |
| -3.220000000000145 | 0.736 | 0.556 | 0.43 |
| -3.210000000000145 | 0.736 | 0.557 | 0.431 |
| -3.200000000000145 | 0.737 | 0.558 | 0.432 |
| -3.190000000000145 | 0.738 | 0.559 | 0.433 |
| -3.180000000000145 | 0.739 | 0.56 | 0.434 |
| -3.170000000000146 | 0.739 | 0.561 | 0.435 |
| -3.160000000000146 | 0.74 | 0.562 | 0.436 |
| -3.150000000000146 | 0.741 | 0.563 | 0.438 |
| -3.140000000000146 | 0.741 | 0.564 | 0.439 |
| -3.130000000000146 | 0.742 | 0.565 | 0.44 |
| -3.120000000000147 | 0.743 | 0.566 | 0.441 |
| -3.110000000000147 | 0.743 | 0.567 | 0.442 |
| -3.100000000000147 | 0.744 | 0.568 | 0.443 |
| -3.090000000000147 | 0.745 | 0.569 | 0.445 |
| -3.080000000000147 | 0.746 | 0.57 | 0.446 |
| -3.070000000000148 | 0.746 | 0.571 | 0.447 |
| -3.060000000000148 | 0.747 | 0.572 | 0.448 |
| -3.050000000000148 | 0.748 | 0.573 | 0.449 |
| -3.040000000000148 | 0.748 | 0.574 | 0.45 |
| -3.030000000000149 | 0.749 | 0.576 | 0.452 |
| -3.020000000000149 | 0.75 | 0.577 | 0.453 |
| -3.010000000000149 | 0.751 | 0.578 | 0.454 |
| -3.000000000000149 | 0.751 | 0.579 | 0.455 |
| -2.990000000000149 | 0.752 | 0.58 | 0.456 |
| -2.98000000000015 | 0.753 | 0.581 | 0.458 |
| -2.97000000000015 | 0.753 | 0.582 | 0.459 |
| -2.96000000000015 | 0.754 | 0.583 | 0.46 |
| -2.95000000000015 | 0.755 | 0.584 | 0.461 |
| -2.94000000000015 | 0.756 | 0.585 | 0.462 |
| -2.930000000000151 | 0.756 | 0.586 | 0.464 |
| -2.920000000000151 | 0.757 | 0.587 | 0.465 |
| -2.910000000000151 | 0.758 | 0.588 | 0.466 |
| -2.900000000000151 | 0.759 | 0.589 | 0.467 |
| -2.890000000000151 | 0.759 | 0.59 | 0.468 |
| -2.880000000000152 | 0.76 | 0.592 | 0.47 |
| -2.870000000000152 | 0.761 | 0.593 | 0.471 |
| -2.860000000000152 | 0.761 | 0.594 | 0.472 |
| -2.850000000000152 | 0.762 | 0.595 | 0.473 |
| -2.840000000000153 | 0.763 | 0.596 | 0.475 |
| -2.830000000000153 | 0.764 | 0.597 | 0.476 |
| -2.820000000000153 | 0.764 | 0.598 | 0.477 |
| -2.810000000000153 | 0.765 | 0.599 | 0.478 |
| -2.800000000000153 | 0.766 | 0.6 | 0.48 |
| -2.790000000000154 | 0.767 | 0.601 | 0.481 |
| -2.780000000000154 | 0.767 | 0.602 | 0.482 |
| -2.770000000000154 | 0.768 | 0.603 | 0.483 |
| -2.760000000000154 | 0.769 | 0.605 | 0.485 |
| -2.750000000000154 | 0.769 | 0.606 | 0.486 |
| -2.740000000000155 | 0.77 | 0.607 | 0.487 |
| -2.730000000000155 | 0.771 | 0.608 | 0.489 |
| -2.720000000000155 | 0.772 | 0.609 | 0.49 |
| -2.710000000000155 | 0.772 | 0.61 | 0.491 |
| -2.700000000000156 | 0.773 | 0.611 | 0.492 |
| -2.690000000000156 | 0.774 | 0.612 | 0.494 |
| -2.680000000000156 | 0.775 | 0.613 | 0.495 |
| -2.670000000000156 | 0.775 | 0.615 | 0.496 |
| -2.660000000000156 | 0.776 | 0.616 | 0.498 |
| -2.650000000000157 | 0.777 | 0.617 | 0.499 |
| -2.640000000000157 | 0.778 | 0.618 | 0.5 |
| -2.630000000000157 | 0.778 | 0.619 | 0.502 |
| -2.620000000000157 | 0.779 | 0.62 | 0.503 |
| -2.610000000000157 | 0.78 | 0.621 | 0.504 |
| -2.600000000000158 | 0.781 | 0.622 | 0.506 |
| -2.590000000000158 | 0.781 | 0.624 | 0.507 |
| -2.580000000000158 | 0.782 | 0.625 | 0.508 |
| -2.570000000000158 | 0.783 | 0.626 | 0.51 |
| -2.560000000000159 | 0.783 | 0.627 | 0.511 |
| -2.550000000000159 | 0.784 | 0.628 | 0.512 |
| -2.54000000000016 | 0.785 | 0.629 | 0.514 |
| -2.530000000000159 | 0.786 | 0.63 | 0.515 |
| -2.520000000000159 | 0.786 | 0.632 | 0.516 |
| -2.51000000000016 | 0.787 | 0.633 | 0.518 |
| -2.50000000000016 | 0.788 | 0.634 | 0.519 |
| -2.49000000000016 | 0.789 | 0.635 | 0.52 |
| -2.48000000000016 | 0.789 | 0.636 | 0.522 |
| -2.47000000000016 | 0.79 | 0.637 | 0.523 |
| -2.460000000000161 | 0.791 | 0.639 | 0.524 |
| -2.450000000000161 | 0.792 | 0.64 | 0.526 |
| -2.440000000000161 | 0.793 | 0.641 | 0.527 |
| -2.430000000000161 | 0.793 | 0.642 | 0.529 |
| -2.420000000000162 | 0.794 | 0.643 | 0.53 |
| -2.410000000000162 | 0.795 | 0.644 | 0.531 |
| -2.400000000000162 | 0.796 | 0.646 | 0.533 |
| -2.390000000000162 | 0.796 | 0.647 | 0.534 |
| -2.380000000000162 | 0.797 | 0.648 | 0.536 |
| -2.370000000000163 | 0.798 | 0.649 | 0.537 |
| -2.360000000000163 | 0.799 | 0.65 | 0.538 |
| -2.350000000000163 | 0.799 | 0.652 | 0.54 |
| -2.340000000000163 | 0.8 | 0.653 | 0.541 |
| -2.330000000000163 | 0.801 | 0.654 | 0.543 |
| -2.320000000000164 | 0.802 | 0.655 | 0.544 |
| -2.310000000000164 | 0.802 | 0.656 | 0.545 |
| -2.300000000000164 | 0.803 | 0.657 | 0.547 |
| -2.290000000000164 | 0.804 | 0.659 | 0.548 |
| -2.280000000000165 | 0.805 | 0.66 | 0.55 |
| -2.270000000000165 | 0.805 | 0.661 | 0.551 |
| -2.260000000000165 | 0.806 | 0.662 | 0.553 |
| -2.250000000000165 | 0.807 | 0.664 | 0.554 |
| -2.240000000000165 | 0.808 | 0.665 | 0.556 |
| -2.230000000000166 | 0.809 | 0.666 | 0.557 |
| -2.220000000000166 | 0.809 | 0.667 | 0.559 |
| -2.210000000000166 | 0.81 | 0.668 | 0.56 |
| -2.200000000000166 | 0.811 | 0.67 | 0.561 |
| -2.190000000000166 | 0.812 | 0.671 | 0.563 |
| -2.180000000000167 | 0.812 | 0.672 | 0.564 |
| -2.170000000000167 | 0.813 | 0.673 | 0.566 |
| -2.160000000000167 | 0.814 | 0.674 | 0.567 |
| -2.150000000000167 | 0.815 | 0.676 | 0.569 |
| -2.140000000000168 | 0.815 | 0.677 | 0.57 |
| -2.130000000000168 | 0.816 | 0.678 | 0.572 |
| -2.120000000000168 | 0.817 | 0.679 | 0.573 |
| -2.110000000000168 | 0.818 | 0.681 | 0.575 |
| -2.100000000000168 | 0.819 | 0.682 | 0.576 |
| -2.090000000000169 | 0.819 | 0.683 | 0.578 |
| -2.080000000000169 | 0.82 | 0.684 | 0.579 |
| -2.070000000000169 | 0.821 | 0.686 | 0.581 |
| -2.060000000000169 | 0.822 | 0.687 | 0.582 |
| -2.050000000000169 | 0.823 | 0.688 | 0.584 |
| -2.04000000000017 | 0.823 | 0.689 | 0.586 |
| -2.03000000000017 | 0.824 | 0.691 | 0.587 |
| -2.02000000000017 | 0.825 | 0.692 | 0.589 |
| -2.01000000000017 | 0.826 | 0.693 | 0.59 |
| -2.000000000000171 | 0.826 | 0.694 | 0.592 |
| -1.99000000000017 | 0.827 | 0.696 | 0.593 |
| -1.98000000000017 | 0.828 | 0.697 | 0.595 |
| -1.97000000000017 | 0.829 | 0.698 | 0.596 |
| -1.96000000000017 | 0.83 | 0.7 | 0.598 |
| -1.95000000000017 | 0.83 | 0.701 | 0.6 |
| -1.94000000000017 | 0.831 | 0.702 | 0.601 |
| -1.93000000000017 | 0.832 | 0.703 | 0.603 |
| -1.92000000000017 | 0.833 | 0.705 | 0.604 |
| -1.91000000000017 | 0.834 | 0.706 | 0.606 |
| -1.90000000000017 | 0.834 | 0.707 | 0.607 |
| -1.89000000000017 | 0.835 | 0.709 | 0.609 |
| -1.88000000000017 | 0.836 | 0.71 | 0.611 |
| -1.87000000000017 | 0.837 | 0.711 | 0.612 |
| -1.86000000000017 | 0.838 | 0.712 | 0.614 |
| -1.85000000000017 | 0.838 | 0.714 | 0.615 |
| -1.84000000000017 | 0.839 | 0.715 | 0.617 |
| -1.83000000000017 | 0.84 | 0.716 | 0.619 |
| -1.82000000000017 | 0.841 | 0.718 | 0.62 |
| -1.81000000000017 | 0.842 | 0.719 | 0.622 |
| -1.80000000000017 | 0.842 | 0.72 | 0.624 |
| -1.79000000000017 | 0.843 | 0.722 | 0.625 |
| -1.78000000000017 | 0.844 | 0.723 | 0.627 |
| -1.77000000000017 | 0.845 | 0.724 | 0.629 |
| -1.76000000000017 | 0.846 | 0.726 | 0.63 |
| -1.75000000000017 | 0.846 | 0.727 | 0.632 |
| -1.74000000000017 | 0.847 | 0.728 | 0.633 |
| -1.73000000000017 | 0.848 | 0.729 | 0.635 |
| -1.72000000000017 | 0.849 | 0.731 | 0.637 |
| -1.71000000000017 | 0.85 | 0.732 | 0.638 |
| -1.70000000000017 | 0.85 | 0.733 | 0.64 |
| -1.69000000000017 | 0.851 | 0.735 | 0.642 |
| -1.68000000000017 | 0.852 | 0.736 | 0.644 |
| -1.67000000000017 | 0.853 | 0.738 | 0.645 |
| -1.66000000000017 | 0.854 | 0.739 | 0.647 |
| -1.65000000000017 | 0.854 | 0.74 | 0.649 |
| -1.64000000000017 | 0.855 | 0.742 | 0.65 |
| -1.63000000000017 | 0.856 | 0.743 | 0.652 |
| -1.62000000000017 | 0.857 | 0.744 | 0.654 |
| -1.61000000000017 | 0.858 | 0.746 | 0.655 |
| -1.60000000000017 | 0.859 | 0.747 | 0.657 |
| -1.59000000000017 | 0.859 | 0.748 | 0.659 |
| -1.58000000000017 | 0.86 | 0.75 | 0.661 |
| -1.57000000000017 | 0.861 | 0.751 | 0.662 |
| -1.56000000000017 | 0.862 | 0.752 | 0.664 |
| -1.55000000000017 | 0.863 | 0.754 | 0.666 |
| -1.54000000000017 | 0.863 | 0.755 | 0.668 |
| -1.53000000000017 | 0.864 | 0.757 | 0.669 |
| -1.52000000000017 | 0.865 | 0.758 | 0.671 |
| -1.51000000000017 | 0.866 | 0.759 | 0.673 |
| -1.50000000000017 | 0.867 | 0.761 | 0.675 |
| -1.49000000000017 | 0.868 | 0.762 | 0.676 |
| -1.48000000000017 | 0.868 | 0.764 | 0.678 |
| -1.47000000000017 | 0.869 | 0.765 | 0.68 |
| -1.46000000000017 | 0.87 | 0.766 | 0.682 |
| -1.45000000000017 | 0.871 | 0.768 | 0.684 |
| -1.44000000000017 | 0.872 | 0.769 | 0.685 |
| -1.43000000000017 | 0.873 | 0.77 | 0.687 |
| -1.42000000000017 | 0.873 | 0.772 | 0.689 |
| -1.41000000000017 | 0.874 | 0.773 | 0.691 |
| -1.40000000000017 | 0.875 | 0.775 | 0.693 |
| -1.39000000000017 | 0.876 | 0.776 | 0.694 |
| -1.38000000000017 | 0.877 | 0.778 | 0.696 |
| -1.37000000000017 | 0.878 | 0.779 | 0.698 |
| -1.36000000000017 | 0.878 | 0.78 | 0.7 |
| -1.35000000000017 | 0.879 | 0.782 | 0.702 |
| -1.34000000000017 | 0.88 | 0.783 | 0.704 |
| -1.33000000000017 | 0.881 | 0.785 | 0.705 |
| -1.32000000000017 | 0.882 | 0.786 | 0.707 |
| -1.31000000000017 | 0.883 | 0.788 | 0.709 |
| -1.30000000000017 | 0.883 | 0.789 | 0.711 |
| -1.29000000000017 | 0.884 | 0.79 | 0.713 |
| -1.28000000000017 | 0.885 | 0.792 | 0.715 |
| -1.27000000000017 | 0.886 | 0.793 | 0.717 |
| -1.26000000000017 | 0.887 | 0.795 | 0.719 |
| -1.25000000000017 | 0.888 | 0.796 | 0.72 |
| -1.24000000000017 | 0.889 | 0.798 | 0.722 |
| -1.23000000000017 | 0.889 | 0.799 | 0.724 |
| -1.22000000000017 | 0.89 | 0.801 | 0.726 |
| -1.21000000000017 | 0.891 | 0.802 | 0.728 |
| -1.20000000000017 | 0.892 | 0.803 | 0.73 |
| -1.19000000000017 | 0.893 | 0.805 | 0.732 |
| -1.18000000000017 | 0.894 | 0.806 | 0.734 |
| -1.17000000000017 | 0.894 | 0.808 | 0.736 |
| -1.16000000000017 | 0.895 | 0.809 | 0.738 |
| -1.15000000000017 | 0.896 | 0.811 | 0.74 |
| -1.14000000000017 | 0.897 | 0.812 | 0.741 |
| -1.13000000000017 | 0.898 | 0.814 | 0.743 |
| -1.12000000000017 | 0.899 | 0.815 | 0.745 |
| -1.11000000000017 | 0.9 | 0.817 | 0.747 |
| -1.10000000000017 | 0.9 | 0.818 | 0.749 |
| -1.09000000000017 | 0.901 | 0.82 | 0.751 |
| -1.08000000000017 | 0.902 | 0.821 | 0.753 |
| -1.07000000000017 | 0.903 | 0.823 | 0.755 |
| -1.06000000000017 | 0.904 | 0.824 | 0.757 |
| -1.05000000000017 | 0.905 | 0.826 | 0.759 |
| -1.04000000000017 | 0.906 | 0.827 | 0.761 |
| -1.03000000000017 | 0.906 | 0.829 | 0.763 |
| -1.02000000000017 | 0.907 | 0.83 | 0.765 |
| -1.01000000000017 | 0.908 | 0.832 | 0.767 |
| -1.00000000000017 | 0.909 | 0.833 | 0.769 |
| -0.99000000000017 | 0.91 | 0.835 | 0.771 |
| -0.98000000000017 | 0.911 | 0.836 | 0.773 |
| -0.97000000000017 | 0.912 | 0.838 | 0.775 |
| -0.96000000000017 | 0.913 | 0.839 | 0.777 |
| -0.95000000000017 | 0.913 | 0.841 | 0.779 |
| -0.94000000000017 | 0.914 | 0.842 | 0.781 |
| -0.93000000000017 | 0.915 | 0.844 | 0.783 |
| -0.92000000000017 | 0.916 | 0.846 | 0.786 |
| -0.91000000000017 | 0.917 | 0.847 | 0.788 |
| -0.90000000000017 | 0.918 | 0.849 | 0.79 |
| -0.890000000000169 | 0.919 | 0.85 | 0.792 |
| -0.880000000000169 | 0.92 | 0.852 | 0.794 |
| -0.870000000000169 | 0.92 | 0.853 | 0.796 |
| -0.860000000000169 | 0.921 | 0.855 | 0.798 |
| -0.850000000000169 | 0.922 | 0.856 | 0.8 |
| -0.840000000000169 | 0.923 | 0.858 | 0.802 |
| -0.830000000000169 | 0.924 | 0.86 | 0.804 |
| -0.820000000000169 | 0.925 | 0.861 | 0.806 |
| -0.810000000000169 | 0.926 | 0.863 | 0.809 |
| -0.800000000000169 | 0.927 | 0.864 | 0.811 |
| -0.790000000000169 | 0.927 | 0.866 | 0.813 |
| -0.780000000000169 | 0.928 | 0.867 | 0.815 |
| -0.770000000000169 | 0.929 | 0.869 | 0.817 |
| -0.760000000000169 | 0.93 | 0.871 | 0.819 |
| -0.750000000000169 | 0.931 | 0.872 | 0.821 |
| -0.740000000000169 | 0.932 | 0.874 | 0.824 |
| -0.730000000000169 | 0.933 | 0.875 | 0.826 |
| -0.720000000000169 | 0.934 | 0.877 | 0.828 |
| -0.710000000000169 | 0.935 | 0.879 | 0.83 |
| -0.700000000000169 | 0.935 | 0.88 | 0.832 |
| -0.690000000000169 | 0.936 | 0.882 | 0.834 |
| -0.680000000000169 | 0.937 | 0.883 | 0.837 |
| -0.670000000000169 | 0.938 | 0.885 | 0.839 |
| -0.660000000000169 | 0.939 | 0.887 | 0.841 |
| -0.650000000000169 | 0.94 | 0.888 | 0.843 |
| -0.640000000000169 | 0.941 | 0.89 | 0.845 |
| -0.630000000000169 | 0.942 | 0.891 | 0.848 |
| -0.620000000000169 | 0.943 | 0.893 | 0.85 |
| -0.610000000000169 | 0.944 | 0.895 | 0.852 |
| -0.600000000000169 | 0.944 | 0.896 | 0.854 |
| -0.590000000000169 | 0.945 | 0.898 | 0.857 |
| -0.580000000000169 | 0.946 | 0.9 | 0.859 |
| -0.570000000000169 | 0.947 | 0.901 | 0.861 |
| -0.560000000000169 | 0.948 | 0.903 | 0.863 |
| -0.550000000000169 | 0.949 | 0.905 | 0.866 |
| -0.540000000000169 | 0.95 | 0.906 | 0.868 |
| -0.530000000000169 | 0.951 | 0.908 | 0.87 |
| -0.520000000000169 | 0.952 | 0.91 | 0.872 |
| -0.510000000000169 | 0.953 | 0.911 | 0.875 |
| -0.500000000000169 | 0.953 | 0.913 | 0.877 |
| -0.490000000000169 | 0.954 | 0.915 | 0.879 |
| -0.480000000000169 | 0.955 | 0.916 | 0.882 |
| -0.470000000000169 | 0.956 | 0.918 | 0.884 |
| -0.460000000000169 | 0.957 | 0.92 | 0.886 |
| -0.450000000000169 | 0.958 | 0.921 | 0.889 |
| -0.440000000000169 | 0.959 | 0.923 | 0.891 |
| -0.430000000000169 | 0.96 | 0.925 | 0.893 |
| -0.420000000000169 | 0.961 | 0.926 | 0.896 |
| -0.410000000000169 | 0.962 | 0.928 | 0.898 |
| -0.400000000000169 | 0.963 | 0.93 | 0.9 |
| -0.390000000000169 | 0.964 | 0.931 | 0.903 |
| -0.380000000000169 | 0.964 | 0.933 | 0.905 |
| -0.370000000000169 | 0.965 | 0.935 | 0.907 |
| -0.360000000000169 | 0.966 | 0.936 | 0.91 |
| -0.350000000000169 | 0.967 | 0.938 | 0.912 |
| -0.340000000000169 | 0.968 | 0.94 | 0.915 |
| -0.330000000000169 | 0.969 | 0.942 | 0.917 |
| -0.320000000000169 | 0.97 | 0.943 | 0.919 |
| -0.310000000000169 | 0.971 | 0.945 | 0.922 |
| -0.300000000000169 | 0.972 | 0.947 | 0.924 |
| -0.290000000000169 | 0.973 | 0.949 | 0.927 |
| -0.280000000000169 | 0.974 | 0.95 | 0.929 |
| -0.270000000000169 | 0.975 | 0.952 | 0.932 |
| -0.260000000000169 | 0.976 | 0.954 | 0.934 |
| -0.250000000000169 | 0.976 | 0.955 | 0.937 |
| -0.240000000000169 | 0.977 | 0.957 | 0.939 |
| -0.230000000000169 | 0.978 | 0.959 | 0.941 |
| -0.220000000000169 | 0.979 | 0.961 | 0.944 |
| -0.210000000000169 | 0.98 | 0.962 | 0.946 |
| -0.200000000000169 | 0.981 | 0.964 | 0.949 |
| -0.190000000000169 | 0.982 | 0.966 | 0.951 |
| -0.180000000000169 | 0.983 | 0.968 | 0.954 |
| -0.170000000000169 | 0.984 | 0.969 | 0.956 |
| -0.160000000000169 | 0.985 | 0.971 | 0.959 |
| -0.150000000000169 | 0.986 | 0.973 | 0.961 |
| -0.140000000000169 | 0.987 | 0.975 | 0.964 |
| -0.130000000000169 | 0.988 | 0.977 | 0.966 |
| -0.120000000000169 | 0.989 | 0.978 | 0.969 |
| -0.110000000000169 | 0.99 | 0.98 | 0.972 |
| -0.100000000000169 | 0.991 | 0.982 | 0.974 |
| -0.0900000000001689 | 0.991 | 0.984 | 0.977 |
| -0.0800000000001689 | 0.992 | 0.986 | 0.979 |
| -0.0700000000001689 | 0.993 | 0.987 | 0.982 |
| -0.0600000000001689 | 0.994 | 0.989 | 0.984 |
| -0.0500000000001689 | 0.995 | 0.991 | 0.987 |
| -0.0400000000001689 | 0.996 | 0.993 | 0.99 |
| -0.0300000000001689 | 0.997 | 0.995 | 0.992 |
| -0.0200000000001689 | 0.998 | 0.996 | 0.995 |
| -0.0100000000001689 | 0.999 | 0.998 | 0.997 |
| -1.6888920817415e-13 | 1 | 1 | 1 |
| 0.00999999999983111 | 1.001 | 1.002 | 1.003 |
| 0.0199999999998311 | 1.002 | 1.004 | 1.005 |
| 0.0299999999998311 | 1.003 | 1.005 | 1.008 |
| 0.0399999999998311 | 1.004 | 1.007 | 1.011 |
| 0.0499999999998311 | 1.005 | 1.009 | 1.013 |
| 0.0599999999998311 | 1.006 | 1.011 | 1.016 |
| 0.0699999999998311 | 1.007 | 1.013 | 1.019 |
| 0.0799999999998311 | 1.008 | 1.015 | 1.021 |
| 0.0899999999998311 | 1.009 | 1.017 | 1.024 |
| 0.0999999999998311 | 1.01 | 1.018 | 1.027 |
| 0.109999999999831 | 1.011 | 1.02 | 1.029 |
| 0.119999999999831 | 1.012 | 1.022 | 1.032 |
| 0.129999999999831 | 1.012 | 1.024 | 1.035 |
| 0.139999999999831 | 1.013 | 1.026 | 1.037 |
| 0.149999999999831 | 1.014 | 1.028 | 1.04 |
| 0.159999999999831 | 1.015 | 1.03 | 1.043 |
| 0.169999999999831 | 1.016 | 1.031 | 1.046 |
| 0.179999999999831 | 1.017 | 1.033 | 1.048 |
| 0.189999999999831 | 1.018 | 1.035 | 1.051 |
| 0.199999999999831 | 1.019 | 1.037 | 1.054 |
| 0.209999999999831 | 1.02 | 1.039 | 1.057 |
| 0.219999999999831 | 1.021 | 1.041 | 1.059 |
| 0.229999999999831 | 1.022 | 1.043 | 1.062 |
| 0.239999999999831 | 1.023 | 1.045 | 1.065 |
| 0.249999999999831 | 1.024 | 1.047 | 1.068 |
| 0.259999999999831 | 1.025 | 1.049 | 1.071 |
| 0.269999999999831 | 1.026 | 1.05 | 1.073 |
| 0.279999999999831 | 1.027 | 1.052 | 1.076 |
| 0.289999999999831 | 1.028 | 1.054 | 1.079 |
| 0.299999999999831 | 1.029 | 1.056 | 1.082 |
| 0.309999999999831 | 1.03 | 1.058 | 1.085 |
| 0.319999999999831 | 1.031 | 1.06 | 1.088 |
| 0.329999999999831 | 1.032 | 1.062 | 1.09 |
| 0.339999999999831 | 1.033 | 1.064 | 1.093 |
| 0.349999999999831 | 1.034 | 1.066 | 1.096 |
| 0.359999999999831 | 1.035 | 1.068 | 1.099 |
| 0.369999999999831 | 1.036 | 1.07 | 1.102 |
| 0.379999999999831 | 1.037 | 1.072 | 1.105 |
| 0.389999999999831 | 1.038 | 1.074 | 1.108 |
| 0.399999999999831 | 1.039 | 1.076 | 1.111 |
| 0.409999999999831 | 1.04 | 1.078 | 1.114 |
| 0.419999999999831 | 1.041 | 1.08 | 1.116 |
| 0.429999999999831 | 1.042 | 1.082 | 1.119 |
| 0.439999999999831 | 1.043 | 1.084 | 1.122 |
| 0.449999999999831 | 1.044 | 1.086 | 1.125 |
| 0.459999999999831 | 1.045 | 1.087 | 1.128 |
| 0.469999999999831 | 1.046 | 1.089 | 1.131 |
| 0.479999999999831 | 1.047 | 1.091 | 1.134 |
| 0.489999999999831 | 1.048 | 1.093 | 1.137 |
| 0.499999999999831 | 1.049 | 1.095 | 1.14 |
| 0.509999999999831 | 1.05 | 1.097 | 1.143 |
| 0.519999999999831 | 1.051 | 1.099 | 1.146 |
| 0.529999999999831 | 1.052 | 1.101 | 1.149 |
| 0.539999999999831 | 1.053 | 1.103 | 1.152 |
| 0.549999999999831 | 1.054 | 1.105 | 1.155 |
| 0.559999999999831 | 1.055 | 1.107 | 1.158 |
| 0.569999999999831 | 1.056 | 1.11 | 1.161 |
| 0.579999999999831 | 1.057 | 1.112 | 1.164 |
| 0.589999999999831 | 1.058 | 1.114 | 1.167 |
| 0.599999999999831 | 1.059 | 1.116 | 1.17 |
| 0.609999999999831 | 1.06 | 1.118 | 1.174 |
| 0.619999999999831 | 1.061 | 1.12 | 1.177 |
| 0.629999999999831 | 1.062 | 1.122 | 1.18 |
| 0.639999999999831 | 1.063 | 1.124 | 1.183 |
| 0.649999999999831 | 1.064 | 1.126 | 1.186 |
| 0.659999999999831 | 1.065 | 1.128 | 1.189 |
| 0.669999999999831 | 1.066 | 1.13 | 1.192 |
| 0.679999999999831 | 1.067 | 1.132 | 1.195 |
| 0.689999999999831 | 1.068 | 1.134 | 1.198 |
| 0.699999999999831 | 1.069 | 1.136 | 1.202 |
| 0.709999999999831 | 1.07 | 1.138 | 1.205 |
| 0.719999999999831 | 1.071 | 1.14 | 1.208 |
| 0.729999999999831 | 1.072 | 1.142 | 1.211 |
| 0.739999999999831 | 1.073 | 1.144 | 1.214 |
| 0.749999999999832 | 1.074 | 1.147 | 1.217 |
| 0.759999999999832 | 1.075 | 1.149 | 1.221 |
| 0.769999999999832 | 1.076 | 1.151 | 1.224 |
| 0.779999999999832 | 1.077 | 1.153 | 1.227 |
| 0.789999999999832 | 1.078 | 1.155 | 1.23 |
| 0.799999999999832 | 1.079 | 1.157 | 1.234 |
| 0.809999999999832 | 1.08 | 1.159 | 1.237 |
| 0.819999999999832 | 1.081 | 1.161 | 1.24 |
| 0.829999999999832 | 1.082 | 1.163 | 1.243 |
| 0.839999999999832 | 1.083 | 1.165 | 1.247 |
| 0.849999999999832 | 1.084 | 1.168 | 1.25 |
| 0.859999999999832 | 1.085 | 1.17 | 1.253 |
| 0.869999999999832 | 1.086 | 1.172 | 1.256 |
| 0.879999999999832 | 1.087 | 1.174 | 1.26 |
| 0.889999999999832 | 1.089 | 1.176 | 1.263 |
| 0.899999999999832 | 1.09 | 1.178 | 1.266 |
| 0.909999999999832 | 1.091 | 1.18 | 1.27 |
| 0.919999999999832 | 1.092 | 1.183 | 1.273 |
| 0.929999999999832 | 1.093 | 1.185 | 1.276 |
| 0.939999999999832 | 1.094 | 1.187 | 1.28 |
| 0.949999999999832 | 1.095 | 1.189 | 1.283 |
| 0.959999999999832 | 1.096 | 1.191 | 1.286 |
| 0.969999999999832 | 1.097 | 1.193 | 1.29 |
| 0.979999999999832 | 1.098 | 1.196 | 1.293 |
| 0.989999999999832 | 1.099 | 1.198 | 1.297 |
| 0.999999999999832 | 1.1 | 1.2 | 1.3 |
| 1.009999999999832 | 1.101 | 1.202 | 1.303 |
| 1.019999999999832 | 1.102 | 1.204 | 1.307 |
| 1.029999999999832 | 1.103 | 1.207 | 1.31 |
| 1.039999999999832 | 1.104 | 1.209 | 1.314 |
| 1.049999999999832 | 1.105 | 1.211 | 1.317 |
| 1.059999999999832 | 1.106 | 1.213 | 1.321 |
| 1.069999999999832 | 1.107 | 1.215 | 1.324 |
| 1.079999999999832 | 1.108 | 1.218 | 1.328 |
| 1.089999999999832 | 1.109 | 1.22 | 1.331 |
| 1.099999999999832 | 1.111 | 1.222 | 1.335 |
| 1.109999999999832 | 1.112 | 1.224 | 1.338 |
| 1.119999999999832 | 1.113 | 1.227 | 1.342 |
| 1.129999999999832 | 1.114 | 1.229 | 1.345 |
| 1.139999999999832 | 1.115 | 1.231 | 1.349 |
| 1.149999999999832 | 1.116 | 1.233 | 1.352 |
| 1.159999999999832 | 1.117 | 1.236 | 1.356 |
| 1.169999999999832 | 1.118 | 1.238 | 1.359 |
| 1.179999999999832 | 1.119 | 1.24 | 1.363 |
| 1.189999999999832 | 1.12 | 1.242 | 1.366 |
| 1.199999999999832 | 1.121 | 1.245 | 1.37 |
| 1.209999999999832 | 1.122 | 1.247 | 1.374 |
| 1.219999999999832 | 1.123 | 1.249 | 1.377 |
| 1.229999999999832 | 1.124 | 1.251 | 1.381 |
| 1.239999999999832 | 1.125 | 1.254 | 1.384 |
| 1.249999999999832 | 1.127 | 1.256 | 1.388 |
| 1.259999999999832 | 1.128 | 1.258 | 1.392 |
| 1.269999999999832 | 1.129 | 1.261 | 1.395 |
| 1.279999999999832 | 1.13 | 1.263 | 1.399 |
| 1.289999999999832 | 1.131 | 1.265 | 1.403 |
| 1.299999999999832 | 1.132 | 1.267 | 1.406 |
| 1.309999999999832 | 1.133 | 1.27 | 1.41 |
| 1.319999999999832 | 1.134 | 1.272 | 1.414 |
| 1.329999999999832 | 1.135 | 1.274 | 1.418 |
| 1.339999999999832 | 1.136 | 1.277 | 1.421 |
| 1.349999999999832 | 1.137 | 1.279 | 1.425 |
| 1.359999999999832 | 1.138 | 1.281 | 1.429 |
| 1.369999999999832 | 1.139 | 1.284 | 1.433 |
| 1.379999999999832 | 1.141 | 1.286 | 1.436 |
| 1.389999999999832 | 1.142 | 1.288 | 1.44 |
| 1.399999999999832 | 1.143 | 1.291 | 1.444 |
| 1.409999999999832 | 1.144 | 1.293 | 1.448 |
| 1.419999999999832 | 1.145 | 1.295 | 1.451 |
| 1.429999999999832 | 1.146 | 1.298 | 1.455 |
| 1.439999999999832 | 1.147 | 1.3 | 1.459 |
| 1.449999999999832 | 1.148 | 1.303 | 1.463 |
| 1.459999999999832 | 1.149 | 1.305 | 1.467 |
| 1.469999999999832 | 1.15 | 1.307 | 1.471 |
| 1.479999999999832 | 1.151 | 1.31 | 1.474 |
| 1.489999999999832 | 1.153 | 1.312 | 1.478 |
| 1.499999999999832 | 1.154 | 1.315 | 1.482 |
| 1.509999999999832 | 1.155 | 1.317 | 1.486 |
| 1.519999999999832 | 1.156 | 1.319 | 1.49 |
| 1.529999999999832 | 1.157 | 1.322 | 1.494 |
| 1.539999999999832 | 1.158 | 1.324 | 1.498 |
| 1.549999999999832 | 1.159 | 1.327 | 1.502 |
| 1.559999999999832 | 1.16 | 1.329 | 1.506 |
| 1.569999999999832 | 1.161 | 1.331 | 1.51 |
| 1.579999999999832 | 1.163 | 1.334 | 1.514 |
| 1.589999999999832 | 1.164 | 1.336 | 1.518 |
| 1.599999999999832 | 1.165 | 1.339 | 1.522 |
| 1.609999999999832 | 1.166 | 1.341 | 1.526 |
| 1.619999999999832 | 1.167 | 1.344 | 1.53 |
| 1.629999999999832 | 1.168 | 1.346 | 1.534 |
| 1.639999999999832 | 1.169 | 1.349 | 1.538 |
| 1.649999999999832 | 1.17 | 1.351 | 1.542 |
| 1.659999999999832 | 1.171 | 1.353 | 1.546 |
| 1.669999999999832 | 1.173 | 1.356 | 1.55 |
| 1.679999999999832 | 1.174 | 1.358 | 1.554 |
| 1.689999999999832 | 1.175 | 1.361 | 1.558 |
| 1.699999999999832 | 1.176 | 1.363 | 1.562 |
| 1.709999999999832 | 1.177 | 1.366 | 1.566 |
| 1.719999999999832 | 1.178 | 1.368 | 1.57 |
| 1.729999999999832 | 1.179 | 1.371 | 1.574 |
| 1.739999999999832 | 1.18 | 1.373 | 1.579 |
| 1.749999999999832 | 1.182 | 1.376 | 1.583 |
| 1.759999999999832 | 1.183 | 1.378 | 1.587 |
| 1.769999999999832 | 1.184 | 1.381 | 1.591 |
| 1.779999999999832 | 1.185 | 1.383 | 1.595 |
| 1.789999999999832 | 1.186 | 1.386 | 1.599 |
| 1.799999999999832 | 1.187 | 1.388 | 1.604 |
| 1.809999999999832 | 1.188 | 1.391 | 1.608 |
| 1.819999999999832 | 1.189 | 1.394 | 1.612 |
| 1.829999999999832 | 1.191 | 1.396 | 1.616 |
| 1.839999999999832 | 1.192 | 1.399 | 1.621 |
| 1.849999999999832 | 1.193 | 1.401 | 1.625 |
| 1.859999999999832 | 1.194 | 1.404 | 1.629 |
| 1.869999999999832 | 1.195 | 1.406 | 1.633 |
| 1.879999999999832 | 1.196 | 1.409 | 1.638 |
| 1.889999999999832 | 1.197 | 1.411 | 1.642 |
| 1.899999999999832 | 1.199 | 1.414 | 1.646 |
| 1.909999999999832 | 1.2 | 1.417 | 1.651 |
| 1.919999999999832 | 1.201 | 1.419 | 1.655 |
| 1.929999999999832 | 1.202 | 1.422 | 1.659 |
| 1.939999999999832 | 1.203 | 1.424 | 1.664 |
| 1.949999999999833 | 1.204 | 1.427 | 1.668 |
| 1.959999999999833 | 1.205 | 1.43 | 1.672 |
| 1.969999999999833 | 1.207 | 1.432 | 1.677 |
| 1.979999999999833 | 1.208 | 1.435 | 1.681 |
| 1.989999999999833 | 1.209 | 1.437 | 1.686 |
| 1.999999999999833 | 1.21 | 1.44 | 1.69 |
| 2.009999999999832 | 1.211 | 1.443 | 1.694 |
| 2.019999999999832 | 1.212 | 1.445 | 1.699 |
| 2.029999999999832 | 1.213 | 1.448 | 1.703 |
| 2.039999999999832 | 1.215 | 1.451 | 1.708 |
| 2.049999999999832 | 1.216 | 1.453 | 1.712 |
| 2.059999999999831 | 1.217 | 1.456 | 1.717 |
| 2.069999999999831 | 1.218 | 1.458 | 1.721 |
| 2.079999999999831 | 1.219 | 1.461 | 1.726 |
| 2.089999999999831 | 1.22 | 1.464 | 1.73 |
| 2.09999999999983 | 1.222 | 1.466 | 1.735 |
| 2.10999999999983 | 1.223 | 1.469 | 1.739 |
| 2.11999999999983 | 1.224 | 1.472 | 1.744 |
| 2.12999999999983 | 1.225 | 1.475 | 1.749 |
| 2.13999999999983 | 1.226 | 1.477 | 1.753 |
| 2.149999999999829 | 1.227 | 1.48 | 1.758 |
| 2.159999999999829 | 1.229 | 1.483 | 1.762 |
| 2.169999999999829 | 1.23 | 1.485 | 1.767 |
| 2.179999999999829 | 1.231 | 1.488 | 1.772 |
| 2.189999999999829 | 1.232 | 1.491 | 1.776 |
| 2.199999999999828 | 1.233 | 1.493 | 1.781 |
| 2.209999999999828 | 1.234 | 1.496 | 1.786 |
| 2.219999999999828 | 1.236 | 1.499 | 1.79 |
| 2.229999999999828 | 1.237 | 1.502 | 1.795 |
| 2.239999999999827 | 1.238 | 1.504 | 1.8 |
| 2.249999999999827 | 1.239 | 1.507 | 1.805 |
| 2.259999999999827 | 1.24 | 1.51 | 1.809 |
| 2.269999999999827 | 1.242 | 1.513 | 1.814 |
| 2.279999999999827 | 1.243 | 1.515 | 1.819 |
| 2.289999999999826 | 1.244 | 1.518 | 1.824 |
| 2.299999999999826 | 1.245 | 1.521 | 1.828 |
| 2.309999999999826 | 1.246 | 1.524 | 1.833 |
| 2.319999999999826 | 1.247 | 1.527 | 1.838 |
| 2.329999999999825 | 1.249 | 1.529 | 1.843 |
| 2.339999999999825 | 1.25 | 1.532 | 1.848 |
| 2.349999999999825 | 1.251 | 1.535 | 1.853 |
| 2.359999999999825 | 1.252 | 1.538 | 1.857 |
| 2.369999999999825 | 1.253 | 1.54 | 1.862 |
| 2.379999999999824 | 1.255 | 1.543 | 1.867 |
| 2.389999999999824 | 1.256 | 1.546 | 1.872 |
| 2.399999999999824 | 1.257 | 1.549 | 1.877 |
| 2.409999999999824 | 1.258 | 1.552 | 1.882 |
| 2.419999999999824 | 1.259 | 1.555 | 1.887 |
| 2.429999999999823 | 1.261 | 1.557 | 1.892 |
| 2.439999999999823 | 1.262 | 1.56 | 1.897 |
| 2.449999999999823 | 1.263 | 1.563 | 1.902 |
| 2.459999999999823 | 1.264 | 1.566 | 1.907 |
| 2.469999999999823 | 1.265 | 1.569 | 1.912 |
| 2.479999999999822 | 1.267 | 1.572 | 1.917 |
| 2.489999999999822 | 1.268 | 1.575 | 1.922 |
| 2.499999999999822 | 1.269 | 1.577 | 1.927 |
| 2.509999999999822 | 1.27 | 1.58 | 1.932 |
| 2.519999999999821 | 1.271 | 1.583 | 1.937 |
| 2.529999999999821 | 1.273 | 1.586 | 1.942 |
| 2.539999999999821 | 1.274 | 1.589 | 1.947 |
| 2.549999999999821 | 1.275 | 1.592 | 1.952 |
| 2.559999999999821 | 1.276 | 1.595 | 1.957 |
| 2.56999999999982 | 1.278 | 1.598 | 1.963 |
| 2.57999999999982 | 1.279 | 1.601 | 1.968 |
| 2.58999999999982 | 1.28 | 1.604 | 1.973 |
| 2.59999999999982 | 1.281 | 1.606 | 1.978 |
| 2.609999999999819 | 1.282 | 1.609 | 1.983 |
| 2.619999999999819 | 1.284 | 1.612 | 1.989 |
| 2.629999999999819 | 1.285 | 1.615 | 1.994 |
| 2.639999999999819 | 1.286 | 1.618 | 1.999 |
| 2.649999999999819 | 1.287 | 1.621 | 2.004 |
| 2.659999999999818 | 1.289 | 1.624 | 2.01 |
| 2.669999999999818 | 1.29 | 1.627 | 2.015 |
| 2.679999999999818 | 1.291 | 1.63 | 2.02 |
| 2.689999999999818 | 1.292 | 1.633 | 2.025 |
| 2.699999999999818 | 1.293 | 1.636 | 2.031 |
| 2.709999999999817 | 1.295 | 1.639 | 2.036 |
| 2.719999999999817 | 1.296 | 1.642 | 2.041 |
| 2.729999999999817 | 1.297 | 1.645 | 2.047 |
| 2.739999999999817 | 1.298 | 1.648 | 2.052 |
| 2.749999999999817 | 1.3 | 1.651 | 2.058 |
| 2.759999999999816 | 1.301 | 1.654 | 2.063 |
| 2.769999999999816 | 1.302 | 1.657 | 2.068 |
| 2.779999999999816 | 1.303 | 1.66 | 2.074 |
| 2.789999999999816 | 1.305 | 1.663 | 2.079 |
| 2.799999999999815 | 1.306 | 1.666 | 2.085 |
| 2.809999999999815 | 1.307 | 1.669 | 2.09 |
| 2.819999999999815 | 1.308 | 1.672 | 2.096 |
| 2.829999999999815 | 1.31 | 1.675 | 2.101 |
| 2.839999999999815 | 1.311 | 1.678 | 2.107 |
| 2.849999999999814 | 1.312 | 1.681 | 2.112 |
| 2.859999999999814 | 1.313 | 1.684 | 2.118 |
| 2.869999999999814 | 1.315 | 1.688 | 2.123 |
| 2.879999999999814 | 1.316 | 1.691 | 2.129 |
| 2.889999999999814 | 1.317 | 1.694 | 2.135 |
| 2.899999999999813 | 1.318 | 1.697 | 2.14 |
| 2.909999999999813 | 1.32 | 1.7 | 2.146 |
| 2.919999999999813 | 1.321 | 1.703 | 2.151 |
| 2.929999999999813 | 1.322 | 1.706 | 2.157 |
| 2.939999999999813 | 1.323 | 1.709 | 2.163 |
| 2.949999999999812 | 1.325 | 1.712 | 2.168 |
| 2.959999999999812 | 1.326 | 1.715 | 2.174 |
| 2.969999999999812 | 1.327 | 1.719 | 2.18 |
| 2.979999999999812 | 1.328 | 1.722 | 2.186 |
| 2.989999999999811 | 1.33 | 1.725 | 2.191 |
| 2.999999999999811 | 1.331 | 1.728 | 2.197 |
| 3.009999999999811 | 1.332 | 1.731 | 2.203 |
| 3.019999999999811 | 1.334 | 1.734 | 2.209 |
| 3.029999999999811 | 1.335 | 1.737 | 2.214 |
| 3.03999999999981 | 1.336 | 1.741 | 2.22 |
| 3.04999999999981 | 1.337 | 1.744 | 2.226 |
| 3.05999999999981 | 1.339 | 1.747 | 2.232 |
| 3.06999999999981 | 1.34 | 1.75 | 2.238 |
| 3.07999999999981 | 1.341 | 1.753 | 2.244 |
| 3.089999999999809 | 1.342 | 1.757 | 2.249 |
| 3.099999999999809 | 1.344 | 1.76 | 2.255 |
| 3.109999999999809 | 1.345 | 1.763 | 2.261 |
| 3.119999999999809 | 1.346 | 1.766 | 2.267 |
| 3.129999999999808 | 1.348 | 1.769 | 2.273 |
| 3.139999999999808 | 1.349 | 1.773 | 2.279 |
| 3.149999999999808 | 1.35 | 1.776 | 2.285 |
| 3.159999999999808 | 1.351 | 1.779 | 2.291 |
| 3.169999999999808 | 1.353 | 1.782 | 2.297 |
| 3.179999999999807 | 1.354 | 1.786 | 2.303 |
| 3.189999999999807 | 1.355 | 1.789 | 2.309 |
| 3.199999999999807 | 1.357 | 1.792 | 2.315 |
| 3.209999999999807 | 1.358 | 1.795 | 2.321 |
| 3.219999999999807 | 1.359 | 1.799 | 2.328 |
| 3.229999999999806 | 1.36 | 1.802 | 2.334 |
| 3.239999999999806 | 1.362 | 1.805 | 2.34 |
| 3.249999999999806 | 1.363 | 1.809 | 2.346 |
| 3.259999999999806 | 1.364 | 1.812 | 2.352 |
| 3.269999999999805 | 1.366 | 1.815 | 2.358 |
| 3.279999999999805 | 1.367 | 1.819 | 2.364 |
| 3.289999999999805 | 1.368 | 1.822 | 2.371 |
| 3.299999999999805 | 1.37 | 1.825 | 2.377 |
| 3.309999999999805 | 1.371 | 1.828 | 2.383 |
| 3.319999999999804 | 1.372 | 1.832 | 2.389 |
| 3.329999999999804 | 1.374 | 1.835 | 2.396 |
| 3.339999999999804 | 1.375 | 1.839 | 2.402 |
| 3.349999999999804 | 1.376 | 1.842 | 2.408 |
| 3.359999999999804 | 1.377 | 1.845 | 2.415 |
| 3.369999999999803 | 1.379 | 1.849 | 2.421 |
| 3.379999999999803 | 1.38 | 1.852 | 2.427 |
| 3.389999999999803 | 1.381 | 1.855 | 2.434 |
| 3.399999999999803 | 1.383 | 1.859 | 2.44 |
| 3.409999999999802 | 1.384 | 1.862 | 2.447 |
| 3.419999999999802 | 1.385 | 1.866 | 2.453 |
| 3.429999999999802 | 1.387 | 1.869 | 2.459 |
| 3.439999999999802 | 1.388 | 1.872 | 2.466 |
| 3.449999999999802 | 1.389 | 1.876 | 2.472 |
| 3.459999999999801 | 1.391 | 1.879 | 2.479 |
| 3.469999999999801 | 1.392 | 1.883 | 2.485 |
| 3.479999999999801 | 1.393 | 1.886 | 2.492 |
| 3.489999999999801 | 1.395 | 1.889 | 2.498 |
| 3.499999999999801 | 1.396 | 1.893 | 2.505 |
| 3.5099999999998 | 1.397 | 1.896 | 2.512 |
| 3.5199999999998 | 1.399 | 1.9 | 2.518 |
| 3.5299999999998 | 1.4 | 1.903 | 2.525 |
| 3.5399999999998 | 1.401 | 1.907 | 2.531 |
| 3.5499999999998 | 1.403 | 1.91 | 2.538 |
| 3.559999999999799 | 1.404 | 1.914 | 2.545 |
| 3.569999999999799 | 1.405 | 1.917 | 2.551 |
| 3.579999999999799 | 1.407 | 1.921 | 2.558 |
| 3.589999999999799 | 1.408 | 1.924 | 2.565 |
| 3.599999999999798 | 1.409 | 1.928 | 2.572 |
| 3.609999999999798 | 1.411 | 1.931 | 2.578 |
| 3.619999999999798 | 1.412 | 1.935 | 2.585 |
| 3.629999999999798 | 1.413 | 1.938 | 2.592 |
| 3.639999999999798 | 1.415 | 1.942 | 2.599 |
| 3.649999999999797 | 1.416 | 1.945 | 2.606 |
| 3.659999999999797 | 1.417 | 1.949 | 2.612 |
| 3.669999999999797 | 1.419 | 1.953 | 2.619 |
| 3.679999999999797 | 1.42 | 1.956 | 2.626 |
| 3.689999999999796 | 1.421 | 1.96 | 2.633 |
| 3.699999999999796 | 1.423 | 1.963 | 2.64 |
| 3.709999999999796 | 1.424 | 1.967 | 2.647 |
| 3.719999999999796 | 1.426 | 1.97 | 2.654 |
| 3.729999999999796 | 1.427 | 1.974 | 2.661 |
| 3.739999999999795 | 1.428 | 1.978 | 2.668 |
| 3.749999999999795 | 1.43 | 1.981 | 2.675 |
| 3.759999999999795 | 1.431 | 1.985 | 2.682 |
| 3.769999999999795 | 1.432 | 1.988 | 2.689 |
| 3.779999999999795 | 1.434 | 1.992 | 2.696 |
| 3.789999999999794 | 1.435 | 1.996 | 2.703 |
| 3.799999999999794 | 1.436 | 1.999 | 2.71 |
| 3.809999999999794 | 1.438 | 2.003 | 2.717 |
| 3.819999999999794 | 1.439 | 2.007 | 2.724 |
| 3.829999999999794 | 1.441 | 2.01 | 2.732 |
| 3.839999999999793 | 1.442 | 2.014 | 2.739 |
| 3.849999999999793 | 1.443 | 2.018 | 2.746 |
| 3.859999999999793 | 1.445 | 2.021 | 2.753 |
| 3.869999999999793 | 1.446 | 2.025 | 2.76 |
| 3.879999999999792 | 1.447 | 2.029 | 2.768 |
| 3.889999999999792 | 1.449 | 2.032 | 2.775 |
| 3.899999999999792 | 1.45 | 2.036 | 2.782 |
| 3.909999999999792 | 1.452 | 2.04 | 2.789 |
| 3.919999999999792 | 1.453 | 2.044 | 2.797 |
| 3.929999999999791 | 1.454 | 2.047 | 2.804 |
| 3.939999999999791 | 1.456 | 2.051 | 2.811 |
| 3.949999999999791 | 1.457 | 2.055 | 2.819 |
| 3.959999999999791 | 1.459 | 2.059 | 2.826 |
| 3.969999999999791 | 1.46 | 2.062 | 2.834 |
| 3.97999999999979 | 1.461 | 2.066 | 2.841 |
| 3.98999999999979 | 1.463 | 2.07 | 2.849 |
| 3.99999999999979 | 1.464 | 2.074 | 2.856 |
| 4.00999999999979 | 1.465 | 2.077 | 2.864 |
| 4.01999999999979 | 1.467 | 2.081 | 2.871 |
| 4.02999999999979 | 1.468 | 2.085 | 2.879 |
| 4.03999999999979 | 1.47 | 2.089 | 2.886 |
| 4.04999999999979 | 1.471 | 2.093 | 2.894 |
| 4.05999999999979 | 1.472 | 2.096 | 2.901 |
| 4.069999999999789 | 1.474 | 2.1 | 2.909 |
| 4.079999999999788 | 1.475 | 2.104 | 2.917 |
| 4.089999999999788 | 1.477 | 2.108 | 2.924 |
| 4.099999999999788 | 1.478 | 2.112 | 2.932 |
| 4.109999999999788 | 1.48 | 2.116 | 2.94 |
| 4.119999999999788 | 1.481 | 2.119 | 2.947 |
| 4.129999999999788 | 1.482 | 2.123 | 2.955 |
| 4.139999999999787 | 1.484 | 2.127 | 2.963 |
| 4.149999999999787 | 1.485 | 2.131 | 2.971 |
| 4.159999999999787 | 1.487 | 2.135 | 2.979 |
| 4.169999999999787 | 1.488 | 2.139 | 2.986 |
| 4.179999999999786 | 1.489 | 2.143 | 2.994 |
| 4.189999999999786 | 1.491 | 2.147 | 3.002 |
| 4.199999999999786 | 1.492 | 2.151 | 3.01 |
| 4.209999999999785 | 1.494 | 2.155 | 3.018 |
| 4.219999999999785 | 1.495 | 2.158 | 3.026 |
| 4.229999999999785 | 1.497 | 2.162 | 3.034 |
| 4.239999999999785 | 1.498 | 2.166 | 3.042 |
| 4.249999999999785 | 1.499 | 2.17 | 3.05 |
| 4.259999999999784 | 1.501 | 2.174 | 3.058 |
| 4.269999999999784 | 1.502 | 2.178 | 3.066 |
| 4.279999999999784 | 1.504 | 2.182 | 3.074 |
| 4.289999999999784 | 1.505 | 2.186 | 3.082 |
| 4.299999999999784 | 1.507 | 2.19 | 3.09 |
| 4.309999999999784 | 1.508 | 2.194 | 3.098 |
| 4.319999999999784 | 1.509 | 2.198 | 3.106 |
| 4.329999999999783 | 1.511 | 2.202 | 3.114 |
| 4.339999999999783 | 1.512 | 2.206 | 3.123 |
| 4.349999999999783 | 1.514 | 2.21 | 3.131 |
| 4.359999999999783 | 1.515 | 2.214 | 3.139 |
| 4.369999999999782 | 1.517 | 2.218 | 3.147 |
| 4.379999999999782 | 1.518 | 2.222 | 3.156 |
| 4.389999999999782 | 1.52 | 2.226 | 3.164 |
| 4.399999999999782 | 1.521 | 2.23 | 3.172 |
| 4.409999999999781 | 1.522 | 2.235 | 3.18 |
| 4.419999999999781 | 1.524 | 2.239 | 3.189 |
| 4.429999999999781 | 1.525 | 2.243 | 3.197 |
| 4.43999999999978 | 1.527 | 2.247 | 3.206 |
| 4.44999999999978 | 1.528 | 2.251 | 3.214 |
| 4.45999999999978 | 1.53 | 2.255 | 3.222 |
| 4.46999999999978 | 1.531 | 2.259 | 3.231 |
| 4.47999999999978 | 1.533 | 2.263 | 3.239 |
| 4.48999999999978 | 1.534 | 2.267 | 3.248 |
| 4.49999999999978 | 1.536 | 2.272 | 3.256 |
| 4.50999999999978 | 1.537 | 2.276 | 3.265 |
| 4.51999999999978 | 1.538 | 2.28 | 3.274 |
| 4.52999999999978 | 1.54 | 2.284 | 3.282 |
| 4.539999999999778 | 1.541 | 2.288 | 3.291 |
| 4.549999999999778 | 1.543 | 2.292 | 3.299 |
| 4.559999999999778 | 1.544 | 2.297 | 3.308 |
| 4.569999999999778 | 1.546 | 2.301 | 3.317 |
| 4.579999999999778 | 1.547 | 2.305 | 3.326 |
| 4.589999999999777 | 1.549 | 2.309 | 3.334 |
| 4.599999999999777 | 1.55 | 2.313 | 3.343 |
| 4.609999999999777 | 1.552 | 2.318 | 3.352 |
| 4.619999999999777 | 1.553 | 2.322 | 3.361 |
| 4.629999999999777 | 1.555 | 2.326 | 3.369 |
| 4.639999999999776 | 1.556 | 2.33 | 3.378 |
| 4.649999999999776 | 1.558 | 2.334 | 3.387 |
| 4.659999999999776 | 1.559 | 2.339 | 3.396 |
| 4.669999999999776 | 1.561 | 2.343 | 3.405 |
| 4.679999999999775 | 1.562 | 2.347 | 3.414 |
| 4.689999999999775 | 1.564 | 2.352 | 3.423 |
| 4.699999999999775 | 1.565 | 2.356 | 3.432 |
| 4.709999999999775 | 1.567 | 2.36 | 3.441 |
| 4.719999999999774 | 1.568 | 2.364 | 3.45 |
| 4.729999999999774 | 1.57 | 2.369 | 3.459 |
| 4.739999999999774 | 1.571 | 2.373 | 3.468 |
| 4.749999999999774 | 1.573 | 2.377 | 3.477 |
| 4.759999999999774 | 1.574 | 2.382 | 3.486 |
| 4.769999999999774 | 1.576 | 2.386 | 3.496 |
| 4.779999999999773 | 1.577 | 2.39 | 3.505 |
| 4.789999999999773 | 1.579 | 2.395 | 3.514 |
| 4.799999999999773 | 1.58 | 2.399 | 3.523 |
| 4.809999999999773 | 1.582 | 2.404 | 3.532 |
| 4.819999999999773 | 1.583 | 2.408 | 3.542 |
| 4.829999999999773 | 1.585 | 2.412 | 3.551 |
| 4.839999999999772 | 1.586 | 2.417 | 3.56 |
| 4.849999999999772 | 1.588 | 2.421 | 3.57 |
| 4.859999999999772 | 1.589 | 2.426 | 3.579 |
| 4.869999999999772 | 1.591 | 2.43 | 3.588 |
| 4.879999999999771 | 1.592 | 2.434 | 3.598 |
| 4.889999999999771 | 1.594 | 2.439 | 3.607 |
| 4.899999999999771 | 1.595 | 2.443 | 3.617 |
| 4.90999999999977 | 1.597 | 2.448 | 3.626 |
| 4.91999999999977 | 1.598 | 2.452 | 3.636 |
| 4.92999999999977 | 1.6 | 2.457 | 3.645 |
| 4.93999999999977 | 1.601 | 2.461 | 3.655 |
| 4.94999999999977 | 1.603 | 2.466 | 3.665 |
| 4.95999999999977 | 1.604 | 2.47 | 3.674 |
| 4.96999999999977 | 1.606 | 2.475 | 3.684 |
| 4.97999999999977 | 1.607 | 2.479 | 3.693 |
| 4.98999999999977 | 1.609 | 2.484 | 3.703 |
| 4.99999999999977 | 1.611 | 2.488 | 3.713 |
| 5.009999999999768 | 1.612 | 2.493 | 3.723 |
| 5.019999999999768 | 1.614 | 2.497 | 3.732 |
| 5.029999999999768 | 1.615 | 2.502 | 3.742 |
| 5.039999999999768 | 1.617 | 2.507 | 3.752 |
| 5.049999999999767 | 1.618 | 2.511 | 3.762 |
| 5.059999999999767 | 1.62 | 2.516 | 3.772 |
| 5.069999999999767 | 1.621 | 2.52 | 3.782 |
| 5.079999999999767 | 1.623 | 2.525 | 3.792 |
| 5.089999999999767 | 1.624 | 2.529 | 3.802 |
| 5.099999999999766 | 1.626 | 2.534 | 3.812 |
| 5.109999999999766 | 1.627 | 2.539 | 3.822 |
| 5.119999999999766 | 1.629 | 2.543 | 3.832 |
| 5.129999999999766 | 1.631 | 2.548 | 3.842 |
| 5.139999999999766 | 1.632 | 2.553 | 3.852 |
| 5.149999999999765 | 1.634 | 2.557 | 3.862 |
| 5.159999999999765 | 1.635 | 2.562 | 3.872 |
| 5.169999999999765 | 1.637 | 2.567 | 3.882 |
| 5.179999999999765 | 1.638 | 2.571 | 3.892 |
| 5.189999999999764 | 1.64 | 2.576 | 3.903 |
| 5.199999999999764 | 1.642 | 2.581 | 3.913 |
| 5.209999999999764 | 1.643 | 2.585 | 3.923 |
| 5.219999999999764 | 1.645 | 2.59 | 3.934 |
| 5.229999999999764 | 1.646 | 2.595 | 3.944 |
| 5.239999999999763 | 1.648 | 2.6 | 3.954 |
| 5.249999999999763 | 1.649 | 2.604 | 3.965 |
| 5.259999999999763 | 1.651 | 2.609 | 3.975 |
| 5.269999999999763 | 1.652 | 2.614 | 3.985 |
| 5.279999999999763 | 1.654 | 2.619 | 3.996 |
| 5.289999999999762 | 1.656 | 2.623 | 4.006 |
| 5.299999999999762 | 1.657 | 2.628 | 4.017 |
| 5.309999999999762 | 1.659 | 2.633 | 4.028 |
| 5.319999999999762 | 1.66 | 2.638 | 4.038 |
| 5.329999999999762 | 1.662 | 2.643 | 4.049 |
| 5.339999999999761 | 1.664 | 2.647 | 4.059 |
| 5.349999999999761 | 1.665 | 2.652 | 4.07 |
| 5.359999999999761 | 1.667 | 2.657 | 4.081 |
| 5.369999999999761 | 1.668 | 2.662 | 4.091 |
| 5.37999999999976 | 1.67 | 2.667 | 4.102 |
| 5.38999999999976 | 1.672 | 2.672 | 4.113 |
| 5.39999999999976 | 1.673 | 2.677 | 4.124 |
| 5.40999999999976 | 1.675 | 2.681 | 4.135 |
| 5.41999999999976 | 1.676 | 2.686 | 4.145 |
| 5.42999999999976 | 1.678 | 2.691 | 4.156 |
| 5.43999999999976 | 1.679 | 2.696 | 4.167 |
| 5.44999999999976 | 1.681 | 2.701 | 4.178 |
| 5.45999999999976 | 1.683 | 2.706 | 4.189 |
| 5.46999999999976 | 1.684 | 2.711 | 4.2 |
| 5.479999999999758 | 1.686 | 2.716 | 4.211 |
| 5.489999999999758 | 1.688 | 2.721 | 4.222 |
| 5.499999999999758 | 1.689 | 2.726 | 4.233 |
| 5.509999999999758 | 1.691 | 2.731 | 4.245 |
| 5.519999999999758 | 1.692 | 2.736 | 4.256 |
| 5.529999999999758 | 1.694 | 2.741 | 4.267 |
| 5.539999999999757 | 1.696 | 2.746 | 4.278 |
| 5.549999999999757 | 1.697 | 2.751 | 4.289 |
| 5.559999999999757 | 1.699 | 2.756 | 4.301 |
| 5.569999999999757 | 1.7 | 2.761 | 4.312 |
| 5.579999999999756 | 1.702 | 2.766 | 4.323 |
| 5.589999999999756 | 1.704 | 2.771 | 4.335 |
| 5.599999999999756 | 1.705 | 2.776 | 4.346 |
| 5.609999999999756 | 1.707 | 2.781 | 4.357 |
| 5.619999999999756 | 1.709 | 2.786 | 4.369 |
| 5.629999999999756 | 1.71 | 2.791 | 4.38 |
| 5.639999999999755 | 1.712 | 2.796 | 4.392 |
| 5.649999999999755 | 1.713 | 2.801 | 4.403 |
| 5.659999999999755 | 1.715 | 2.807 | 4.415 |
| 5.669999999999755 | 1.717 | 2.812 | 4.426 |
| 5.679999999999754 | 1.718 | 2.817 | 4.438 |
| 5.689999999999754 | 1.72 | 2.822 | 4.45 |
| 5.699999999999754 | 1.722 | 2.827 | 4.461 |
| 5.709999999999754 | 1.723 | 2.832 | 4.473 |
| 5.719999999999754 | 1.725 | 2.837 | 4.485 |
| 5.729999999999753 | 1.727 | 2.843 | 4.497 |
| 5.739999999999753 | 1.728 | 2.848 | 4.509 |
| 5.749999999999753 | 1.73 | 2.853 | 4.52 |
| 5.759999999999753 | 1.731 | 2.858 | 4.532 |
| 5.769999999999753 | 1.733 | 2.863 | 4.544 |
| 5.779999999999752 | 1.735 | 2.869 | 4.556 |
| 5.789999999999752 | 1.736 | 2.874 | 4.568 |
| 5.799999999999752 | 1.738 | 2.879 | 4.58 |
| 5.809999999999752 | 1.74 | 2.884 | 4.592 |
| 5.819999999999752 | 1.741 | 2.89 | 4.604 |
| 5.829999999999751 | 1.743 | 2.895 | 4.616 |
| 5.839999999999751 | 1.745 | 2.9 | 4.628 |
| 5.849999999999751 | 1.746 | 2.905 | 4.641 |
| 5.859999999999751 | 1.748 | 2.911 | 4.653 |
| 5.86999999999975 | 1.75 | 2.916 | 4.665 |
| 5.87999999999975 | 1.751 | 2.921 | 4.677 |
| 5.88999999999975 | 1.753 | 2.927 | 4.689 |
| 5.89999999999975 | 1.755 | 2.932 | 4.702 |
| 5.90999999999975 | 1.756 | 2.937 | 4.714 |
| 5.91999999999975 | 1.758 | 2.943 | 4.727 |
| 5.92999999999975 | 1.76 | 2.948 | 4.739 |
| 5.93999999999975 | 1.761 | 2.953 | 4.751 |
| 5.949999999999748 | 1.763 | 2.959 | 4.764 |
| 5.959999999999748 | 1.765 | 2.964 | 4.776 |
| 5.969999999999748 | 1.767 | 2.97 | 4.789 |
| 5.979999999999748 | 1.768 | 2.975 | 4.802 |
| 5.989999999999747 | 1.77 | 2.981 | 4.814 |
| 5.999999999999747 | 1.772 | 2.986 | 4.827 |
| 6.009999999999747 | 1.773 | 2.991 | 4.839 |
| 6.019999999999747 | 1.775 | 2.997 | 4.852 |
| 6.029999999999747 | 1.777 | 3.002 | 4.865 |
| 6.039999999999746 | 1.778 | 3.008 | 4.878 |
| 6.049999999999746 | 1.78 | 3.013 | 4.891 |
| 6.059999999999746 | 1.782 | 3.019 | 4.903 |
| 6.069999999999746 | 1.783 | 3.024 | 4.916 |
| 6.079999999999746 | 1.785 | 3.03 | 4.929 |
| 6.089999999999745 | 1.787 | 3.035 | 4.942 |
| 6.099999999999745 | 1.789 | 3.041 | 4.955 |
| 6.109999999999745 | 1.79 | 3.046 | 4.968 |
| 6.119999999999745 | 1.792 | 3.052 | 4.981 |
| 6.129999999999745 | 1.794 | 3.058 | 4.994 |
| 6.139999999999744 | 1.795 | 3.063 | 5.007 |
| 6.149999999999744 | 1.797 | 3.069 | 5.021 |
| 6.159999999999744 | 1.799 | 3.074 | 5.034 |
| 6.169999999999744 | 1.8 | 3.08 | 5.047 |
| 6.179999999999744 | 1.802 | 3.086 | 5.06 |
| 6.189999999999744 | 1.804 | 3.091 | 5.074 |
| 6.199999999999743 | 1.806 | 3.097 | 5.087 |
| 6.209999999999743 | 1.807 | 3.103 | 5.1 |
| 6.219999999999743 | 1.809 | 3.108 | 5.114 |
| 6.229999999999743 | 1.811 | 3.114 | 5.127 |
| 6.239999999999742 | 1.813 | 3.12 | 5.141 |
| 6.249999999999742 | 1.814 | 3.125 | 5.154 |
| 6.259999999999742 | 1.816 | 3.131 | 5.168 |
| 6.269999999999742 | 1.818 | 3.137 | 5.181 |
| 6.279999999999741 | 1.819 | 3.142 | 5.195 |
| 6.289999999999741 | 1.821 | 3.148 | 5.208 |
| 6.299999999999741 | 1.823 | 3.154 | 5.222 |
| 6.309999999999741 | 1.825 | 3.16 | 5.236 |
| 6.319999999999741 | 1.826 | 3.165 | 5.25 |
| 6.329999999999741 | 1.828 | 3.171 | 5.263 |
| 6.33999999999974 | 1.83 | 3.177 | 5.277 |
| 6.34999999999974 | 1.832 | 3.183 | 5.291 |
| 6.35999999999974 | 1.833 | 3.189 | 5.305 |
| 6.36999999999974 | 1.835 | 3.194 | 5.319 |
| 6.37999999999974 | 1.837 | 3.2 | 5.333 |
| 6.38999999999974 | 1.839 | 3.206 | 5.347 |
| 6.39999999999974 | 1.84 | 3.212 | 5.361 |
| 6.409999999999738 | 1.842 | 3.218 | 5.375 |
| 6.419999999999738 | 1.844 | 3.224 | 5.389 |
| 6.429999999999738 | 1.846 | 3.23 | 5.403 |
| 6.439999999999738 | 1.847 | 3.235 | 5.417 |
| 6.449999999999738 | 1.849 | 3.241 | 5.432 |
| 6.459999999999737 | 1.851 | 3.247 | 5.446 |
| 6.469999999999737 | 1.853 | 3.253 | 5.46 |
| 6.479999999999737 | 1.854 | 3.259 | 5.475 |
| 6.489999999999737 | 1.856 | 3.265 | 5.489 |
| 6.499999999999737 | 1.858 | 3.271 | 5.503 |
| 6.509999999999736 | 1.86 | 3.277 | 5.518 |
| 6.519999999999736 | 1.862 | 3.283 | 5.532 |
| 6.529999999999736 | 1.863 | 3.289 | 5.547 |
| 6.539999999999736 | 1.865 | 3.295 | 5.561 |
| 6.549999999999736 | 1.867 | 3.301 | 5.576 |
| 6.559999999999735 | 1.869 | 3.307 | 5.591 |
| 6.569999999999735 | 1.87 | 3.313 | 5.605 |
| 6.579999999999735 | 1.872 | 3.319 | 5.62 |
| 6.589999999999735 | 1.874 | 3.325 | 5.635 |
| 6.599999999999734 | 1.876 | 3.331 | 5.65 |
| 6.609999999999734 | 1.878 | 3.337 | 5.665 |
| 6.619999999999734 | 1.879 | 3.343 | 5.679 |
| 6.629999999999734 | 1.881 | 3.349 | 5.694 |
| 6.639999999999734 | 1.883 | 3.356 | 5.709 |
| 6.649999999999734 | 1.885 | 3.362 | 5.724 |
| 6.659999999999734 | 1.887 | 3.368 | 5.739 |
| 6.669999999999733 | 1.888 | 3.374 | 5.754 |
| 6.679999999999733 | 1.89 | 3.38 | 5.77 |
| 6.689999999999733 | 1.892 | 3.386 | 5.785 |
| 6.699999999999733 | 1.894 | 3.392 | 5.8 |
| 6.709999999999732 | 1.896 | 3.399 | 5.815 |
| 6.719999999999732 | 1.897 | 3.405 | 5.83 |
| 6.729999999999732 | 1.899 | 3.411 | 5.846 |
| 6.739999999999731 | 1.901 | 3.417 | 5.861 |
| 6.749999999999731 | 1.903 | 3.424 | 5.876 |
| 6.759999999999731 | 1.905 | 3.43 | 5.892 |
| 6.769999999999731 | 1.906 | 3.436 | 5.907 |
| 6.77999999999973 | 1.908 | 3.442 | 5.923 |
| 6.78999999999973 | 1.91 | 3.449 | 5.938 |
| 6.79999999999973 | 1.912 | 3.455 | 5.954 |
| 6.80999999999973 | 1.914 | 3.461 | 5.97 |
| 6.81999999999973 | 1.916 | 3.467 | 5.985 |
| 6.82999999999973 | 1.917 | 3.474 | 6.001 |
| 6.83999999999973 | 1.919 | 3.48 | 6.017 |
| 6.84999999999973 | 1.921 | 3.487 | 6.033 |
| 6.85999999999973 | 1.923 | 3.493 | 6.049 |
| 6.86999999999973 | 1.925 | 3.499 | 6.064 |
| 6.879999999999728 | 1.927 | 3.506 | 6.08 |
| 6.889999999999728 | 1.928 | 3.512 | 6.096 |
| 6.899999999999728 | 1.93 | 3.518 | 6.112 |
| 6.909999999999728 | 1.932 | 3.525 | 6.128 |
| 6.919999999999728 | 1.934 | 3.531 | 6.145 |
| 6.929999999999727 | 1.936 | 3.538 | 6.161 |
| 6.939999999999727 | 1.938 | 3.544 | 6.177 |
| 6.949999999999727 | 1.939 | 3.551 | 6.193 |
| 6.959999999999727 | 1.941 | 3.557 | 6.209 |
| 6.969999999999727 | 1.943 | 3.564 | 6.226 |
| 6.979999999999726 | 1.945 | 3.57 | 6.242 |
| 6.989999999999726 | 1.947 | 3.577 | 6.258 |
| 6.999999999999726 | 1.949 | 3.583 | 6.275 |
| 7.009999999999726 | 1.951 | 3.59 | 6.291 |
| 7.019999999999726 | 1.952 | 3.596 | 6.308 |
| 7.029999999999725 | 1.954 | 3.603 | 6.324 |
| 7.039999999999725 | 1.956 | 3.609 | 6.341 |
| 7.049999999999725 | 1.958 | 3.616 | 6.358 |
| 7.059999999999725 | 1.96 | 3.623 | 6.374 |
| 7.069999999999724 | 1.962 | 3.629 | 6.391 |
| 7.079999999999724 | 1.964 | 3.636 | 6.408 |
| 7.089999999999724 | 1.966 | 3.642 | 6.425 |
| 7.099999999999724 | 1.967 | 3.649 | 6.442 |
| 7.109999999999724 | 1.969 | 3.656 | 6.459 |
| 7.119999999999724 | 1.971 | 3.662 | 6.476 |
| 7.129999999999724 | 1.973 | 3.669 | 6.493 |
| 7.139999999999723 | 1.975 | 3.676 | 6.51 |
| 7.149999999999723 | 1.977 | 3.683 | 6.527 |
| 7.159999999999723 | 1.979 | 3.689 | 6.544 |
| 7.169999999999723 | 1.981 | 3.696 | 6.561 |
| 7.179999999999722 | 1.982 | 3.703 | 6.578 |
| 7.189999999999722 | 1.984 | 3.709 | 6.596 |
| 7.199999999999722 | 1.986 | 3.716 | 6.613 |
| 7.209999999999721 | 1.988 | 3.723 | 6.63 |
| 7.219999999999721 | 1.99 | 3.73 | 6.648 |
| 7.229999999999721 | 1.992 | 3.737 | 6.665 |
| 7.23999999999972 | 1.994 | 3.743 | 6.683 |
| 7.24999999999972 | 1.996 | 3.75 | 6.7 |
| 7.25999999999972 | 1.998 | 3.757 | 6.718 |
| 7.26999999999972 | 2 | 3.764 | 6.735 |
| 7.27999999999972 | 2.001 | 3.771 | 6.753 |
| 7.28999999999972 | 2.003 | 3.778 | 6.771 |
| 7.29999999999972 | 2.005 | 3.785 | 6.789 |
| 7.30999999999972 | 2.007 | 3.792 | 6.807 |
| 7.31999999999972 | 2.009 | 3.798 | 6.824 |
| 7.329999999999719 | 2.011 | 3.805 | 6.842 |
| 7.33999999999972 | 2.013 | 3.812 | 6.86 |
| 7.349999999999719 | 2.015 | 3.819 | 6.878 |
| 7.359999999999719 | 2.017 | 3.826 | 6.896 |
| 7.369999999999718 | 2.019 | 3.833 | 6.915 |
| 7.379999999999718 | 2.021 | 3.84 | 6.933 |
| 7.389999999999718 | 2.023 | 3.847 | 6.951 |
| 7.399999999999718 | 2.024 | 3.854 | 6.969 |
| 7.409999999999717 | 2.026 | 3.861 | 6.987 |
| 7.419999999999717 | 2.028 | 3.868 | 7.006 |
| 7.429999999999717 | 2.03 | 3.875 | 7.024 |
| 7.439999999999717 | 2.032 | 3.882 | 7.043 |
| 7.449999999999716 | 2.034 | 3.89 | 7.061 |
| 7.459999999999716 | 2.036 | 3.897 | 7.08 |
| 7.469999999999716 | 2.038 | 3.904 | 7.098 |
| 7.479999999999716 | 2.04 | 3.911 | 7.117 |
| 7.489999999999715 | 2.042 | 3.918 | 7.136 |
| 7.499999999999715 | 2.044 | 3.925 | 7.154 |
| 7.509999999999715 | 2.046 | 3.932 | 7.173 |
| 7.519999999999715 | 2.048 | 3.94 | 7.192 |
| 7.529999999999715 | 2.05 | 3.947 | 7.211 |
| 7.539999999999714 | 2.052 | 3.954 | 7.23 |
| 7.549999999999714 | 2.054 | 3.961 | 7.249 |
| 7.559999999999714 | 2.056 | 3.968 | 7.268 |
| 7.569999999999714 | 2.058 | 3.976 | 7.287 |
| 7.579999999999714 | 2.059 | 3.983 | 7.306 |
| 7.589999999999714 | 2.061 | 3.99 | 7.325 |
| 7.599999999999714 | 2.063 | 3.997 | 7.345 |
| 7.609999999999713 | 2.065 | 4.005 | 7.364 |
| 7.619999999999713 | 2.067 | 4.012 | 7.383 |
| 7.629999999999713 | 2.069 | 4.019 | 7.403 |
| 7.639999999999713 | 2.071 | 4.027 | 7.422 |
| 7.649999999999712 | 2.073 | 4.034 | 7.442 |
| 7.659999999999712 | 2.075 | 4.041 | 7.461 |
| 7.669999999999712 | 2.077 | 4.049 | 7.481 |
| 7.679999999999712 | 2.079 | 4.056 | 7.5 |
| 7.689999999999712 | 2.081 | 4.064 | 7.52 |
| 7.699999999999711 | 2.083 | 4.071 | 7.54 |
| 7.709999999999711 | 2.085 | 4.078 | 7.56 |
| 7.719999999999711 | 2.087 | 4.086 | 7.58 |
| 7.729999999999711 | 2.089 | 4.093 | 7.599 |
| 7.73999999999971 | 2.091 | 4.101 | 7.619 |
| 7.74999999999971 | 2.093 | 4.108 | 7.639 |
| 7.75999999999971 | 2.095 | 4.116 | 7.659 |
| 7.76999999999971 | 2.097 | 4.123 | 7.68 |
| 7.77999999999971 | 2.099 | 4.131 | 7.7 |
| 7.78999999999971 | 2.101 | 4.138 | 7.72 |
| 7.79999999999971 | 2.103 | 4.146 | 7.74 |
| 7.80999999999971 | 2.105 | 4.153 | 7.761 |
| 7.819999999999709 | 2.107 | 4.161 | 7.781 |
| 7.829999999999709 | 2.109 | 4.169 | 7.801 |
| 7.839999999999708 | 2.111 | 4.176 | 7.822 |
| 7.849999999999708 | 2.113 | 4.184 | 7.843 |
| 7.859999999999708 | 2.115 | 4.191 | 7.863 |
| 7.869999999999708 | 2.117 | 4.199 | 7.884 |
| 7.879999999999707 | 2.119 | 4.207 | 7.904 |
| 7.889999999999707 | 2.121 | 4.214 | 7.925 |
| 7.899999999999707 | 2.123 | 4.222 | 7.946 |
| 7.909999999999707 | 2.125 | 4.23 | 7.967 |
| 7.919999999999706 | 2.127 | 4.238 | 7.988 |
| 7.929999999999706 | 2.129 | 4.245 | 8.009 |
| 7.939999999999706 | 2.131 | 4.253 | 8.03 |
| 7.949999999999706 | 2.133 | 4.261 | 8.051 |
| 7.959999999999705 | 2.135 | 4.269 | 8.072 |
| 7.969999999999705 | 2.137 | 4.276 | 8.093 |
| 7.979999999999705 | 2.14 | 4.284 | 8.115 |
| 7.989999999999705 | 2.142 | 4.292 | 8.136 |
| 7.999999999999705 | 2.144 | 4.3 | 8.157 |
| 8.009999999999703 | 2.146 | 4.308 | 8.179 |
| 8.019999999999705 | 2.148 | 4.316 | 8.2 |
| 8.029999999999704 | 2.15 | 4.323 | 8.222 |
| 8.039999999999704 | 2.152 | 4.331 | 8.243 |
| 8.049999999999704 | 2.154 | 4.339 | 8.265 |
| 8.059999999999704 | 2.156 | 4.347 | 8.287 |
| 8.069999999999704 | 2.158 | 4.355 | 8.309 |
| 8.079999999999703 | 2.16 | 4.363 | 8.33 |
| 8.089999999999703 | 2.162 | 4.371 | 8.352 |
| 8.099999999999701 | 2.164 | 4.379 | 8.374 |
| 8.109999999999703 | 2.166 | 4.387 | 8.396 |
| 8.119999999999703 | 2.168 | 4.395 | 8.418 |
| 8.129999999999702 | 2.17 | 4.403 | 8.44 |
| 8.139999999999702 | 2.172 | 4.411 | 8.463 |
| 8.1499999999997 | 2.174 | 4.419 | 8.485 |
| 8.1599999999997 | 2.177 | 4.427 | 8.507 |
| 8.1699999999997 | 2.179 | 4.435 | 8.529 |
| 8.1799999999997 | 2.181 | 4.443 | 8.552 |
| 8.1899999999997 | 2.183 | 4.451 | 8.574 |
| 8.1999999999997 | 2.185 | 4.46 | 8.597 |
| 8.2099999999997 | 2.187 | 4.468 | 8.619 |
| 8.2199999999997 | 2.189 | 4.476 | 8.642 |
| 8.2299999999997 | 2.191 | 4.484 | 8.665 |
| 8.2399999999997 | 2.193 | 4.492 | 8.687 |
| 8.2499999999997 | 2.195 | 4.5 | 8.71 |
| 8.2599999999997 | 2.197 | 4.509 | 8.733 |
| 8.2699999999997 | 2.199 | 4.517 | 8.756 |
| 8.2799999999997 | 2.202 | 4.525 | 8.779 |
| 8.289999999999697 | 2.204 | 4.533 | 8.802 |
| 8.299999999999699 | 2.206 | 4.542 | 8.825 |
| 8.309999999999699 | 2.208 | 4.55 | 8.848 |
| 8.319999999999698 | 2.21 | 4.558 | 8.872 |
| 8.329999999999698 | 2.212 | 4.566 | 8.895 |
| 8.339999999999698 | 2.214 | 4.575 | 8.918 |
| 8.349999999999698 | 2.216 | 4.583 | 8.942 |
| 8.359999999999697 | 2.218 | 4.592 | 8.965 |
| 8.369999999999697 | 2.221 | 4.6 | 8.989 |
| 8.379999999999695 | 2.223 | 4.608 | 9.013 |
| 8.389999999999697 | 2.225 | 4.617 | 9.036 |
| 8.399999999999697 | 2.227 | 4.625 | 9.06 |
| 8.409999999999696 | 2.229 | 4.634 | 9.084 |
| 8.419999999999696 | 2.231 | 4.642 | 9.108 |
| 8.429999999999694 | 2.233 | 4.65 | 9.132 |
| 8.439999999999696 | 2.235 | 4.659 | 9.155 |
| 8.449999999999696 | 2.238 | 4.667 | 9.18 |
| 8.459999999999695 | 2.24 | 4.676 | 9.204 |
| 8.469999999999695 | 2.242 | 4.685 | 9.228 |
| 8.479999999999693 | 2.244 | 4.693 | 9.252 |
| 8.489999999999695 | 2.246 | 4.702 | 9.276 |
| 8.499999999999694 | 2.248 | 4.71 | 9.301 |
| 8.509999999999694 | 2.25 | 4.719 | 9.325 |
| 8.519999999999694 | 2.253 | 4.727 | 9.35 |
| 8.529999999999694 | 2.255 | 4.736 | 9.374 |
| 8.539999999999694 | 2.257 | 4.745 | 9.399 |
| 8.549999999999693 | 2.259 | 4.753 | 9.424 |
| 8.55999999999969 | 2.261 | 4.762 | 9.448 |
| 8.56999999999969 | 2.263 | 4.771 | 9.473 |
| 8.57999999999969 | 2.265 | 4.779 | 9.498 |
| 8.58999999999969 | 2.268 | 4.788 | 9.523 |
| 8.59999999999969 | 2.27 | 4.797 | 9.548 |
| 8.60999999999969 | 2.272 | 4.806 | 9.573 |
| 8.61999999999969 | 2.274 | 4.814 | 9.598 |
| 8.62999999999969 | 2.276 | 4.823 | 9.623 |
| 8.63999999999969 | 2.278 | 4.832 | 9.649 |
| 8.64999999999969 | 2.281 | 4.841 | 9.674 |
| 8.65999999999969 | 2.283 | 4.85 | 9.7 |
| 8.66999999999969 | 2.285 | 4.858 | 9.725 |
| 8.67999999999969 | 2.287 | 4.867 | 9.751 |
| 8.68999999999969 | 2.289 | 4.876 | 9.776 |
| 8.69999999999969 | 2.291 | 4.885 | 9.802 |
| 8.70999999999969 | 2.294 | 4.894 | 9.828 |
| 8.71999999999969 | 2.296 | 4.903 | 9.853 |
| 8.72999999999969 | 2.298 | 4.912 | 9.879 |
| 8.73999999999969 | 2.3 | 4.921 | 9.905 |
| 8.74999999999969 | 2.302 | 4.93 | 9.931 |
| 8.759999999999687 | 2.305 | 4.939 | 9.957 |
| 8.769999999999689 | 2.307 | 4.948 | 9.984 |
| 8.779999999999688 | 2.309 | 4.957 | 10.01 |
| 8.789999999999688 | 2.311 | 4.966 | 10.036 |
| 8.799999999999686 | 2.313 | 4.975 | 10.062 |
| 8.809999999999688 | 2.316 | 4.984 | 10.089 |
| 8.819999999999688 | 2.318 | 4.993 | 10.115 |
| 8.829999999999687 | 2.32 | 5.002 | 10.142 |
| 8.839999999999687 | 2.322 | 5.011 | 10.169 |
| 8.849999999999685 | 2.324 | 5.021 | 10.195 |
| 8.859999999999687 | 2.327 | 5.03 | 10.222 |
| 8.869999999999687 | 2.329 | 5.039 | 10.249 |
| 8.879999999999686 | 2.331 | 5.048 | 10.276 |
| 8.889999999999686 | 2.333 | 5.057 | 10.303 |
| 8.899999999999684 | 2.336 | 5.067 | 10.33 |
| 8.909999999999686 | 2.338 | 5.076 | 10.357 |
| 8.919999999999686 | 2.34 | 5.085 | 10.384 |
| 8.929999999999685 | 2.342 | 5.094 | 10.412 |
| 8.939999999999685 | 2.345 | 5.104 | 10.439 |
| 8.949999999999685 | 2.347 | 5.113 | 10.466 |
| 8.959999999999685 | 2.349 | 5.122 | 10.494 |
| 8.969999999999684 | 2.351 | 5.132 | 10.521 |
| 8.979999999999684 | 2.353 | 5.141 | 10.549 |
| 8.989999999999682 | 2.356 | 5.15 | 10.577 |
| 8.999999999999684 | 2.358 | 5.16 | 10.604 |
| 9.009999999999684 | 2.36 | 5.169 | 10.632 |
| 9.019999999999683 | 2.362 | 5.179 | 10.66 |
| 9.029999999999683 | 2.365 | 5.188 | 10.688 |
| 9.039999999999681 | 2.367 | 5.198 | 10.716 |
| 9.049999999999683 | 2.369 | 5.207 | 10.745 |
| 9.05999999999968 | 2.371 | 5.217 | 10.773 |
| 9.06999999999968 | 2.374 | 5.226 | 10.801 |
| 9.07999999999968 | 2.376 | 5.236 | 10.829 |
| 9.08999999999968 | 2.378 | 5.245 | 10.858 |
| 9.09999999999968 | 2.381 | 5.255 | 10.886 |
| 9.10999999999968 | 2.383 | 5.264 | 10.915 |
| 9.11999999999968 | 2.385 | 5.274 | 10.944 |
| 9.12999999999968 | 2.387 | 5.284 | 10.972 |
| 9.13999999999968 | 2.39 | 5.293 | 11.001 |
| 9.14999999999968 | 2.392 | 5.303 | 11.03 |
| 9.15999999999968 | 2.394 | 5.313 | 11.059 |
| 9.16999999999968 | 2.396 | 5.322 | 11.088 |
| 9.17999999999968 | 2.399 | 5.332 | 11.117 |
| 9.18999999999968 | 2.401 | 5.342 | 11.147 |
| 9.19999999999968 | 2.403 | 5.351 | 11.176 |
| 9.20999999999968 | 2.406 | 5.361 | 11.205 |
| 9.21999999999968 | 2.408 | 5.371 | 11.235 |
| 9.229999999999677 | 2.41 | 5.381 | 11.264 |
| 9.239999999999679 | 2.413 | 5.391 | 11.294 |
| 9.249999999999678 | 2.415 | 5.4 | 11.323 |
| 9.259999999999678 | 2.417 | 5.41 | 11.353 |
| 9.269999999999678 | 2.419 | 5.42 | 11.383 |
| 9.279999999999678 | 2.422 | 5.43 | 11.413 |
| 9.289999999999678 | 2.424 | 5.44 | 11.443 |
| 9.299999999999677 | 2.426 | 5.45 | 11.473 |
| 9.309999999999677 | 2.429 | 5.46 | 11.503 |
| 9.319999999999675 | 2.431 | 5.47 | 11.533 |
| 9.329999999999677 | 2.433 | 5.48 | 11.564 |
| 9.339999999999677 | 2.436 | 5.49 | 11.594 |
| 9.349999999999676 | 2.438 | 5.5 | 11.624 |
| 9.359999999999676 | 2.44 | 5.51 | 11.655 |
| 9.369999999999674 | 2.443 | 5.52 | 11.686 |
| 9.379999999999676 | 2.445 | 5.53 | 11.716 |
| 9.389999999999675 | 2.447 | 5.54 | 11.747 |
| 9.399999999999675 | 2.45 | 5.55 | 11.778 |
| 9.409999999999675 | 2.452 | 5.56 | 11.809 |
| 9.419999999999675 | 2.454 | 5.57 | 11.84 |
| 9.429999999999675 | 2.457 | 5.581 | 11.871 |
| 9.439999999999674 | 2.459 | 5.591 | 11.902 |
| 9.449999999999674 | 2.461 | 5.601 | 11.933 |
| 9.459999999999672 | 2.464 | 5.611 | 11.965 |
| 9.469999999999674 | 2.466 | 5.621 | 11.996 |
| 9.479999999999674 | 2.468 | 5.632 | 12.028 |
| 9.489999999999673 | 2.471 | 5.642 | 12.059 |
| 9.499999999999673 | 2.473 | 5.652 | 12.091 |
| 9.509999999999671 | 2.475 | 5.663 | 12.123 |
| 9.519999999999673 | 2.478 | 5.673 | 12.155 |
| 9.529999999999673 | 2.48 | 5.683 | 12.187 |
| 9.539999999999672 | 2.482 | 5.694 | 12.219 |
| 9.549999999999672 | 2.485 | 5.704 | 12.251 |
| 9.55999999999967 | 2.487 | 5.714 | 12.283 |
| 9.56999999999967 | 2.49 | 5.725 | 12.315 |
| 9.57999999999967 | 2.492 | 5.735 | 12.347 |
| 9.58999999999967 | 2.494 | 5.746 | 12.38 |
| 9.59999999999967 | 2.497 | 5.756 | 12.412 |
| 9.60999999999967 | 2.499 | 5.767 | 12.445 |
| 9.61999999999967 | 2.501 | 5.777 | 12.478 |
| 9.62999999999967 | 2.504 | 5.788 | 12.51 |
| 9.63999999999967 | 2.506 | 5.798 | 12.543 |
| 9.64999999999967 | 2.509 | 5.809 | 12.576 |
| 9.65999999999967 | 2.511 | 5.82 | 12.609 |
| 9.66999999999967 | 2.513 | 5.83 | 12.642 |
| 9.67999999999967 | 2.516 | 5.841 | 12.676 |
| 9.689999999999667 | 2.518 | 5.851 | 12.709 |
| 9.699999999999669 | 2.521 | 5.862 | 12.742 |
| 9.709999999999669 | 2.523 | 5.873 | 12.776 |
| 9.719999999999668 | 2.525 | 5.884 | 12.809 |
| 9.729999999999668 | 2.528 | 5.894 | 12.843 |
| 9.739999999999666 | 2.53 | 5.905 | 12.877 |
| 9.749999999999668 | 2.533 | 5.916 | 12.911 |
| 9.759999999999668 | 2.535 | 5.927 | 12.945 |
| 9.769999999999667 | 2.538 | 5.937 | 12.979 |
| 9.779999999999667 | 2.54 | 5.948 | 13.013 |
| 9.789999999999665 | 2.542 | 5.959 | 13.047 |
| 9.799999999999667 | 2.545 | 5.97 | 13.081 |
| 9.809999999999667 | 2.547 | 5.981 | 13.115 |
| 9.819999999999666 | 2.55 | 5.992 | 13.15 |
| 9.829999999999666 | 2.552 | 6.003 | 13.184 |
| 9.839999999999664 | 2.554 | 6.014 | 13.219 |
| 9.849999999999666 | 2.557 | 6.025 | 13.254 |
| 9.859999999999665 | 2.559 | 6.036 | 13.289 |
| 9.869999999999665 | 2.562 | 6.047 | 13.324 |
| 9.879999999999663 | 2.564 | 6.058 | 13.359 |
| 9.889999999999665 | 2.567 | 6.069 | 13.394 |
| 9.899999999999665 | 2.569 | 6.08 | 13.429 |
| 9.909999999999664 | 2.572 | 6.091 | 13.464 |
| 9.919999999999664 | 2.574 | 6.102 | 13.5 |
| 9.929999999999662 | 2.576 | 6.113 | 13.535 |
| 9.939999999999664 | 2.579 | 6.124 | 13.571 |
| 9.949999999999664 | 2.581 | 6.136 | 13.606 |
| 9.95999999999966 | 2.584 | 6.147 | 13.642 |
| 9.96999999999966 | 2.586 | 6.158 | 13.678 |
| 9.97999999999966 | 2.589 | 6.169 | 13.714 |
| 9.98999999999966 | 2.591 | 6.18 | 13.75 |
| 9.99999999999966 | 2.594 | 6.192 | 13.786 |